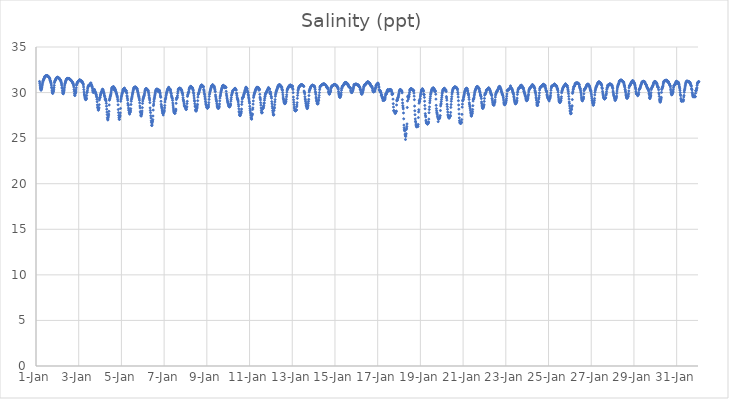
| Category | Salinity (ppt) |
|---|---|
| 44562.166666666664 | 31.22 |
| 44562.177083333336 | 31.03 |
| 44562.1875 | 30.82 |
| 44562.197916666664 | 30.61 |
| 44562.208333333336 | 30.48 |
| 44562.21875 | 30.39 |
| 44562.229166666664 | 30.3 |
| 44562.239583333336 | 30.26 |
| 44562.25 | 30.39 |
| 44562.260416666664 | 30.41 |
| 44562.270833333336 | 30.51 |
| 44562.28125 | 30.62 |
| 44562.291666666664 | 30.81 |
| 44562.302083333336 | 30.95 |
| 44562.3125 | 31.11 |
| 44562.322916666664 | 31.23 |
| 44562.333333333336 | 31.31 |
| 44562.34375 | 31.37 |
| 44562.354166666664 | 31.42 |
| 44562.364583333336 | 31.47 |
| 44562.375 | 31.52 |
| 44562.385416666664 | 31.57 |
| 44562.395833333336 | 31.65 |
| 44562.40625 | 31.72 |
| 44562.416666666664 | 31.78 |
| 44562.427083333336 | 31.79 |
| 44562.4375 | 31.8 |
| 44562.447916666664 | 31.82 |
| 44562.458333333336 | 31.82 |
| 44562.46875 | 31.83 |
| 44562.479166666664 | 31.84 |
| 44562.489583333336 | 31.85 |
| 44562.5 | 31.85 |
| 44562.510416666664 | 31.86 |
| 44562.520833333336 | 31.86 |
| 44562.53125 | 31.82 |
| 44562.541666666664 | 31.8 |
| 44562.552083333336 | 31.81 |
| 44562.5625 | 31.81 |
| 44562.572916666664 | 31.76 |
| 44562.583333333336 | 31.73 |
| 44562.59375 | 31.73 |
| 44562.604166666664 | 31.69 |
| 44562.614583333336 | 31.65 |
| 44562.625 | 31.6 |
| 44562.635416666664 | 31.55 |
| 44562.645833333336 | 31.51 |
| 44562.65625 | 31.38 |
| 44562.666666666664 | 31.33 |
| 44562.677083333336 | 31.25 |
| 44562.6875 | 31.17 |
| 44562.697916666664 | 31.08 |
| 44562.708333333336 | 30.97 |
| 44562.71875 | 30.82 |
| 44562.729166666664 | 30.59 |
| 44562.739583333336 | 30.5 |
| 44562.75 | 30.26 |
| 44562.760416666664 | 30.09 |
| 44562.770833333336 | 29.98 |
| 44562.78125 | 29.9 |
| 44562.791666666664 | 29.96 |
| 44562.802083333336 | 30.08 |
| 44562.8125 | 30.1 |
| 44562.822916666664 | 30.2 |
| 44562.833333333336 | 30.37 |
| 44562.84375 | 30.55 |
| 44562.854166666664 | 30.79 |
| 44562.864583333336 | 31.08 |
| 44562.875 | 31.19 |
| 44562.885416666664 | 31.27 |
| 44562.895833333336 | 31.32 |
| 44562.90625 | 31.37 |
| 44562.916666666664 | 31.42 |
| 44562.927083333336 | 31.46 |
| 44562.9375 | 31.53 |
| 44562.947916666664 | 31.58 |
| 44562.958333333336 | 31.61 |
| 44562.96875 | 31.63 |
| 44562.979166666664 | 31.66 |
| 44562.989583333336 | 31.66 |
| 44563.0 | 31.67 |
| 44563.010416666664 | 31.67 |
| 44563.020833333336 | 31.68 |
| 44563.03125 | 31.68 |
| 44563.041666666664 | 31.61 |
| 44563.052083333336 | 31.59 |
| 44563.0625 | 31.57 |
| 44563.072916666664 | 31.54 |
| 44563.083333333336 | 31.58 |
| 44563.09375 | 31.55 |
| 44563.104166666664 | 31.49 |
| 44563.114583333336 | 31.48 |
| 44563.125 | 31.39 |
| 44563.135416666664 | 31.4 |
| 44563.145833333336 | 31.34 |
| 44563.15625 | 31.32 |
| 44563.166666666664 | 31.24 |
| 44563.177083333336 | 31.15 |
| 44563.1875 | 31.06 |
| 44563.197916666664 | 30.93 |
| 44563.208333333336 | 30.78 |
| 44563.21875 | 30.55 |
| 44563.229166666664 | 30.45 |
| 44563.239583333336 | 30.21 |
| 44563.25 | 30.05 |
| 44563.260416666664 | 29.92 |
| 44563.270833333336 | 29.87 |
| 44563.28125 | 29.88 |
| 44563.291666666664 | 30.04 |
| 44563.302083333336 | 30.09 |
| 44563.3125 | 30.22 |
| 44563.322916666664 | 30.39 |
| 44563.333333333336 | 30.6 |
| 44563.34375 | 30.82 |
| 44563.354166666664 | 30.95 |
| 44563.364583333336 | 31.02 |
| 44563.375 | 31.12 |
| 44563.385416666664 | 31.21 |
| 44563.395833333336 | 31.28 |
| 44563.40625 | 31.35 |
| 44563.416666666664 | 31.4 |
| 44563.427083333336 | 31.45 |
| 44563.4375 | 31.5 |
| 44563.447916666664 | 31.53 |
| 44563.458333333336 | 31.53 |
| 44563.46875 | 31.55 |
| 44563.479166666664 | 31.55 |
| 44563.489583333336 | 31.55 |
| 44563.5 | 31.54 |
| 44563.510416666664 | 31.54 |
| 44563.520833333336 | 31.54 |
| 44563.53125 | 31.54 |
| 44563.541666666664 | 31.54 |
| 44563.552083333336 | 31.54 |
| 44563.5625 | 31.51 |
| 44563.572916666664 | 31.5 |
| 44563.583333333336 | 31.46 |
| 44563.59375 | 31.46 |
| 44563.604166666664 | 31.38 |
| 44563.614583333336 | 31.39 |
| 44563.625 | 31.37 |
| 44563.635416666664 | 31.35 |
| 44563.645833333336 | 31.35 |
| 44563.65625 | 31.3 |
| 44563.666666666664 | 31.27 |
| 44563.677083333336 | 31.22 |
| 44563.6875 | 31.19 |
| 44563.697916666664 | 31.18 |
| 44563.708333333336 | 31.08 |
| 44563.71875 | 31.07 |
| 44563.729166666664 | 31.05 |
| 44563.739583333336 | 30.97 |
| 44563.75 | 30.9 |
| 44563.760416666664 | 30.76 |
| 44563.770833333336 | 30.61 |
| 44563.78125 | 30.34 |
| 44563.791666666664 | 30.14 |
| 44563.802083333336 | 29.89 |
| 44563.8125 | 29.71 |
| 44563.822916666664 | 29.67 |
| 44563.833333333336 | 29.84 |
| 44563.84375 | 29.93 |
| 44563.854166666664 | 29.98 |
| 44563.864583333336 | 30.12 |
| 44563.875 | 30.29 |
| 44563.885416666664 | 30.52 |
| 44563.895833333336 | 30.8 |
| 44563.90625 | 30.9 |
| 44563.916666666664 | 30.99 |
| 44563.927083333336 | 31.05 |
| 44563.9375 | 31.1 |
| 44563.947916666664 | 31.13 |
| 44563.958333333336 | 31.15 |
| 44563.96875 | 31.18 |
| 44563.979166666664 | 31.22 |
| 44563.989583333336 | 31.26 |
| 44564.0 | 31.3 |
| 44564.010416666664 | 31.33 |
| 44564.020833333336 | 31.35 |
| 44564.03125 | 31.37 |
| 44564.041666666664 | 31.38 |
| 44564.052083333336 | 31.39 |
| 44564.0625 | 31.38 |
| 44564.072916666664 | 31.29 |
| 44564.083333333336 | 31.3 |
| 44564.09375 | 31.29 |
| 44564.104166666664 | 31.28 |
| 44564.114583333336 | 31.29 |
| 44564.125 | 31.28 |
| 44564.135416666664 | 31.24 |
| 44564.145833333336 | 31.21 |
| 44564.15625 | 31.24 |
| 44564.166666666664 | 31.14 |
| 44564.177083333336 | 31.1 |
| 44564.1875 | 31.06 |
| 44564.197916666664 | 31.01 |
| 44564.208333333336 | 30.95 |
| 44564.21875 | 30.84 |
| 44564.229166666664 | 30.61 |
| 44564.239583333336 | 30.33 |
| 44564.25 | 30.07 |
| 44564.260416666664 | 29.84 |
| 44564.270833333336 | 29.73 |
| 44564.28125 | 29.61 |
| 44564.291666666664 | 29.46 |
| 44564.302083333336 | 29.36 |
| 44564.3125 | 29.27 |
| 44564.322916666664 | 29.22 |
| 44564.333333333336 | 29.25 |
| 44564.34375 | 29.26 |
| 44564.354166666664 | 29.32 |
| 44564.364583333336 | 29.39 |
| 44564.375 | 29.68 |
| 44564.385416666664 | 29.99 |
| 44564.395833333336 | 30.05 |
| 44564.40625 | 30.2 |
| 44564.416666666664 | 30.41 |
| 44564.427083333336 | 30.55 |
| 44564.4375 | 30.67 |
| 44564.447916666664 | 30.72 |
| 44564.458333333336 | 30.76 |
| 44564.46875 | 30.8 |
| 44564.479166666664 | 30.8 |
| 44564.489583333336 | 30.81 |
| 44564.5 | 30.79 |
| 44564.510416666664 | 30.8 |
| 44564.520833333336 | 30.86 |
| 44564.53125 | 30.93 |
| 44564.541666666664 | 30.94 |
| 44564.552083333336 | 31 |
| 44564.5625 | 31.02 |
| 44564.572916666664 | 31.06 |
| 44564.583333333336 | 30.91 |
| 44564.59375 | 30.85 |
| 44564.604166666664 | 30.75 |
| 44564.614583333336 | 30.72 |
| 44564.625 | 30.68 |
| 44564.635416666664 | 30.58 |
| 44564.645833333336 | 30.41 |
| 44564.65625 | 30.23 |
| 44564.666666666664 | 30.13 |
| 44564.677083333336 | 30.02 |
| 44564.6875 | 30.03 |
| 44564.697916666664 | 30.09 |
| 44564.708333333336 | 30.09 |
| 44564.71875 | 30.34 |
| 44564.729166666664 | 30.22 |
| 44564.739583333336 | 30.34 |
| 44564.75 | 30.2 |
| 44564.760416666664 | 30.13 |
| 44564.770833333336 | 30.06 |
| 44564.78125 | 30.04 |
| 44564.791666666664 | 29.97 |
| 44564.802083333336 | 29.9 |
| 44564.8125 | 29.76 |
| 44564.822916666664 | 29.75 |
| 44564.833333333336 | 29.6 |
| 44564.84375 | 29.49 |
| 44564.854166666664 | 29.26 |
| 44564.864583333336 | 28.99 |
| 44564.875 | 28.65 |
| 44564.885416666664 | 28.41 |
| 44564.895833333336 | 28.33 |
| 44564.90625 | 28.21 |
| 44564.916666666664 | 28.07 |
| 44564.927083333336 | 28.11 |
| 44564.9375 | 28.25 |
| 44564.947916666664 | 28.35 |
| 44564.958333333336 | 28.67 |
| 44564.96875 | 29.19 |
| 44564.979166666664 | 29.37 |
| 44564.989583333336 | 29.47 |
| 44565.0 | 29.47 |
| 44565.010416666664 | 29.63 |
| 44565.020833333336 | 29.74 |
| 44565.03125 | 29.83 |
| 44565.041666666664 | 29.88 |
| 44565.052083333336 | 29.99 |
| 44565.0625 | 30.04 |
| 44565.072916666664 | 30.08 |
| 44565.083333333336 | 30.15 |
| 44565.09375 | 30.25 |
| 44565.104166666664 | 30.32 |
| 44565.114583333336 | 30.37 |
| 44565.125 | 30.34 |
| 44565.135416666664 | 30.3 |
| 44565.145833333336 | 30.22 |
| 44565.15625 | 30.04 |
| 44565.166666666664 | 30.08 |
| 44565.177083333336 | 29.96 |
| 44565.1875 | 29.89 |
| 44565.197916666664 | 29.73 |
| 44565.208333333336 | 29.64 |
| 44565.21875 | 29.56 |
| 44565.229166666664 | 29.41 |
| 44565.239583333336 | 29.22 |
| 44565.25 | 29.29 |
| 44565.260416666664 | 29.28 |
| 44565.270833333336 | 29.18 |
| 44565.28125 | 29.07 |
| 44565.291666666664 | 28.82 |
| 44565.302083333336 | 28.51 |
| 44565.3125 | 28.18 |
| 44565.322916666664 | 27.86 |
| 44565.333333333336 | 27.58 |
| 44565.34375 | 27.26 |
| 44565.354166666664 | 27.1 |
| 44565.364583333336 | 26.99 |
| 44565.375 | 27.1 |
| 44565.385416666664 | 27.3 |
| 44565.395833333336 | 27.45 |
| 44565.40625 | 27.64 |
| 44565.416666666664 | 27.94 |
| 44565.427083333336 | 28.64 |
| 44565.4375 | 29.16 |
| 44565.447916666664 | 29.27 |
| 44565.458333333336 | 29.34 |
| 44565.46875 | 29.49 |
| 44565.479166666664 | 29.59 |
| 44565.489583333336 | 29.67 |
| 44565.5 | 29.78 |
| 44565.510416666664 | 29.93 |
| 44565.520833333336 | 30.07 |
| 44565.53125 | 30.26 |
| 44565.541666666664 | 30.4 |
| 44565.552083333336 | 30.49 |
| 44565.5625 | 30.54 |
| 44565.572916666664 | 30.56 |
| 44565.583333333336 | 30.56 |
| 44565.59375 | 30.58 |
| 44565.604166666664 | 30.6 |
| 44565.614583333336 | 30.62 |
| 44565.625 | 30.63 |
| 44565.635416666664 | 30.65 |
| 44565.645833333336 | 30.57 |
| 44565.65625 | 30.36 |
| 44565.666666666664 | 30.27 |
| 44565.677083333336 | 30.5 |
| 44565.6875 | 30.45 |
| 44565.697916666664 | 30.39 |
| 44565.708333333336 | 30.31 |
| 44565.71875 | 30.29 |
| 44565.729166666664 | 30.14 |
| 44565.739583333336 | 30.14 |
| 44565.75 | 30.04 |
| 44565.760416666664 | 29.93 |
| 44565.770833333336 | 29.87 |
| 44565.78125 | 29.83 |
| 44565.791666666664 | 29.67 |
| 44565.802083333336 | 29.6 |
| 44565.8125 | 29.48 |
| 44565.822916666664 | 29.27 |
| 44565.833333333336 | 29.07 |
| 44565.84375 | 28.66 |
| 44565.854166666664 | 28.14 |
| 44565.864583333336 | 27.8 |
| 44565.875 | 27.49 |
| 44565.885416666664 | 27.24 |
| 44565.895833333336 | 27.08 |
| 44565.90625 | 27.05 |
| 44565.916666666664 | 27.31 |
| 44565.927083333336 | 27.37 |
| 44565.9375 | 27.5 |
| 44565.947916666664 | 27.77 |
| 44565.958333333336 | 28.26 |
| 44565.96875 | 29.05 |
| 44565.979166666664 | 29.27 |
| 44565.989583333336 | 29.4 |
| 44566.0 | 29.55 |
| 44566.010416666664 | 29.67 |
| 44566.020833333336 | 29.81 |
| 44566.03125 | 29.9 |
| 44566.041666666664 | 29.96 |
| 44566.052083333336 | 30.05 |
| 44566.0625 | 30.19 |
| 44566.072916666664 | 30.28 |
| 44566.083333333336 | 30.33 |
| 44566.09375 | 30.36 |
| 44566.104166666664 | 30.39 |
| 44566.114583333336 | 30.43 |
| 44566.125 | 30.44 |
| 44566.135416666664 | 30.48 |
| 44566.145833333336 | 30.48 |
| 44566.15625 | 30.33 |
| 44566.166666666664 | 30.26 |
| 44566.177083333336 | 30.17 |
| 44566.1875 | 30.32 |
| 44566.197916666664 | 30.26 |
| 44566.208333333336 | 30.17 |
| 44566.21875 | 30.19 |
| 44566.229166666664 | 30.2 |
| 44566.239583333336 | 30.02 |
| 44566.25 | 29.93 |
| 44566.260416666664 | 29.65 |
| 44566.270833333336 | 29.53 |
| 44566.28125 | 29.35 |
| 44566.291666666664 | 29.17 |
| 44566.302083333336 | 28.82 |
| 44566.3125 | 28.64 |
| 44566.322916666664 | 28.59 |
| 44566.333333333336 | 28.3 |
| 44566.34375 | 28.09 |
| 44566.354166666664 | 28.02 |
| 44566.364583333336 | 27.84 |
| 44566.375 | 27.73 |
| 44566.385416666664 | 27.63 |
| 44566.395833333336 | 27.8 |
| 44566.40625 | 27.86 |
| 44566.416666666664 | 27.88 |
| 44566.427083333336 | 28.01 |
| 44566.4375 | 28.23 |
| 44566.447916666664 | 28.69 |
| 44566.458333333336 | 29.04 |
| 44566.46875 | 29.23 |
| 44566.479166666664 | 29.35 |
| 44566.489583333336 | 29.48 |
| 44566.5 | 29.6 |
| 44566.510416666664 | 29.74 |
| 44566.520833333336 | 29.86 |
| 44566.53125 | 29.98 |
| 44566.541666666664 | 30.09 |
| 44566.552083333336 | 30.24 |
| 44566.5625 | 30.34 |
| 44566.572916666664 | 30.45 |
| 44566.583333333336 | 30.5 |
| 44566.59375 | 30.55 |
| 44566.604166666664 | 30.57 |
| 44566.614583333336 | 30.58 |
| 44566.625 | 30.58 |
| 44566.635416666664 | 30.59 |
| 44566.645833333336 | 30.6 |
| 44566.65625 | 30.6 |
| 44566.666666666664 | 30.6 |
| 44566.677083333336 | 30.54 |
| 44566.6875 | 30.57 |
| 44566.697916666664 | 30.53 |
| 44566.708333333336 | 30.43 |
| 44566.71875 | 30.44 |
| 44566.729166666664 | 30.43 |
| 44566.739583333336 | 30.37 |
| 44566.75 | 30.23 |
| 44566.760416666664 | 30.15 |
| 44566.770833333336 | 30.04 |
| 44566.78125 | 29.94 |
| 44566.791666666664 | 29.81 |
| 44566.802083333336 | 29.67 |
| 44566.8125 | 29.56 |
| 44566.822916666664 | 29.49 |
| 44566.833333333336 | 29.32 |
| 44566.84375 | 29.16 |
| 44566.854166666664 | 28.87 |
| 44566.864583333336 | 28.53 |
| 44566.875 | 28.31 |
| 44566.885416666664 | 27.92 |
| 44566.895833333336 | 27.79 |
| 44566.90625 | 27.53 |
| 44566.916666666664 | 27.44 |
| 44566.927083333336 | 27.43 |
| 44566.9375 | 27.62 |
| 44566.947916666664 | 27.64 |
| 44566.958333333336 | 27.77 |
| 44566.96875 | 27.98 |
| 44566.979166666664 | 28.35 |
| 44566.989583333336 | 28.81 |
| 44567.0 | 29.07 |
| 44567.010416666664 | 29.24 |
| 44567.020833333336 | 29.36 |
| 44567.03125 | 29.44 |
| 44567.041666666664 | 29.53 |
| 44567.052083333336 | 29.6 |
| 44567.0625 | 29.66 |
| 44567.072916666664 | 29.75 |
| 44567.083333333336 | 29.89 |
| 44567.09375 | 30.07 |
| 44567.104166666664 | 30.2 |
| 44567.114583333336 | 30.29 |
| 44567.125 | 30.34 |
| 44567.135416666664 | 30.38 |
| 44567.145833333336 | 30.41 |
| 44567.15625 | 30.42 |
| 44567.166666666664 | 30.44 |
| 44567.177083333336 | 30.43 |
| 44567.1875 | 30.34 |
| 44567.197916666664 | 30.36 |
| 44567.208333333336 | 30.29 |
| 44567.21875 | 30.29 |
| 44567.229166666664 | 30.24 |
| 44567.239583333336 | 30.28 |
| 44567.25 | 30.18 |
| 44567.260416666664 | 30.17 |
| 44567.270833333336 | 30.01 |
| 44567.28125 | 29.85 |
| 44567.291666666664 | 29.7 |
| 44567.302083333336 | 29.49 |
| 44567.3125 | 29.34 |
| 44567.322916666664 | 29.18 |
| 44567.333333333336 | 28.9 |
| 44567.34375 | 28.32 |
| 44567.354166666664 | 28.04 |
| 44567.364583333336 | 27.8 |
| 44567.375 | 27.46 |
| 44567.385416666664 | 27.21 |
| 44567.395833333336 | 26.9 |
| 44567.40625 | 26.72 |
| 44567.416666666664 | 26.4 |
| 44567.427083333336 | 26.38 |
| 44567.4375 | 26.55 |
| 44567.447916666664 | 26.75 |
| 44567.458333333336 | 26.87 |
| 44567.46875 | 27.03 |
| 44567.479166666664 | 27.43 |
| 44567.489583333336 | 28.08 |
| 44567.5 | 28.57 |
| 44567.510416666664 | 28.74 |
| 44567.520833333336 | 29.01 |
| 44567.53125 | 29.21 |
| 44567.541666666664 | 29.36 |
| 44567.552083333336 | 29.5 |
| 44567.5625 | 29.64 |
| 44567.572916666664 | 29.76 |
| 44567.583333333336 | 29.92 |
| 44567.59375 | 30.08 |
| 44567.604166666664 | 30.18 |
| 44567.614583333336 | 30.25 |
| 44567.625 | 30.3 |
| 44567.635416666664 | 30.35 |
| 44567.645833333336 | 30.36 |
| 44567.65625 | 30.37 |
| 44567.666666666664 | 30.36 |
| 44567.677083333336 | 30.35 |
| 44567.6875 | 30.36 |
| 44567.697916666664 | 30.35 |
| 44567.708333333336 | 30.28 |
| 44567.71875 | 30.11 |
| 44567.729166666664 | 30.2 |
| 44567.739583333336 | 30.23 |
| 44567.75 | 30.29 |
| 44567.760416666664 | 30.24 |
| 44567.770833333336 | 30.24 |
| 44567.78125 | 30.23 |
| 44567.791666666664 | 30.16 |
| 44567.802083333336 | 30 |
| 44567.8125 | 29.9 |
| 44567.822916666664 | 29.72 |
| 44567.833333333336 | 29.57 |
| 44567.84375 | 29.48 |
| 44567.854166666664 | 29.04 |
| 44567.864583333336 | 28.71 |
| 44567.875 | 28.52 |
| 44567.885416666664 | 28.4 |
| 44567.895833333336 | 28.26 |
| 44567.90625 | 28.08 |
| 44567.916666666664 | 27.97 |
| 44567.927083333336 | 27.85 |
| 44567.9375 | 27.72 |
| 44567.947916666664 | 27.69 |
| 44567.958333333336 | 27.54 |
| 44567.96875 | 27.83 |
| 44567.979166666664 | 27.79 |
| 44567.989583333336 | 27.87 |
| 44568.0 | 27.93 |
| 44568.010416666664 | 28.07 |
| 44568.020833333336 | 28.32 |
| 44568.03125 | 28.58 |
| 44568.041666666664 | 28.96 |
| 44568.052083333336 | 29.2 |
| 44568.0625 | 29.31 |
| 44568.072916666664 | 29.39 |
| 44568.083333333336 | 29.51 |
| 44568.09375 | 29.69 |
| 44568.104166666664 | 29.83 |
| 44568.114583333336 | 29.95 |
| 44568.125 | 30.04 |
| 44568.135416666664 | 30.12 |
| 44568.145833333336 | 30.22 |
| 44568.15625 | 30.3 |
| 44568.166666666664 | 30.36 |
| 44568.177083333336 | 30.43 |
| 44568.1875 | 30.45 |
| 44568.197916666664 | 30.51 |
| 44568.208333333336 | 30.56 |
| 44568.21875 | 30.58 |
| 44568.229166666664 | 30.42 |
| 44568.239583333336 | 30.3 |
| 44568.25 | 30.36 |
| 44568.260416666664 | 30.37 |
| 44568.270833333336 | 30.34 |
| 44568.28125 | 30.36 |
| 44568.291666666664 | 30.35 |
| 44568.302083333336 | 30.2 |
| 44568.3125 | 30.05 |
| 44568.322916666664 | 29.94 |
| 44568.333333333336 | 29.87 |
| 44568.34375 | 29.68 |
| 44568.354166666664 | 29.54 |
| 44568.364583333336 | 29.5 |
| 44568.375 | 29.41 |
| 44568.385416666664 | 29.34 |
| 44568.395833333336 | 29.14 |
| 44568.40625 | 28.86 |
| 44568.416666666664 | 28.63 |
| 44568.427083333336 | 28.41 |
| 44568.4375 | 28.2 |
| 44568.447916666664 | 28.01 |
| 44568.458333333336 | 27.91 |
| 44568.46875 | 27.83 |
| 44568.479166666664 | 27.78 |
| 44568.489583333336 | 27.73 |
| 44568.5 | 27.73 |
| 44568.510416666664 | 27.73 |
| 44568.520833333336 | 27.88 |
| 44568.53125 | 27.96 |
| 44568.541666666664 | 28.04 |
| 44568.552083333336 | 28.18 |
| 44568.5625 | 28.82 |
| 44568.572916666664 | 29.23 |
| 44568.583333333336 | 29.39 |
| 44568.59375 | 29.42 |
| 44568.604166666664 | 29.39 |
| 44568.614583333336 | 29.47 |
| 44568.625 | 29.65 |
| 44568.635416666664 | 29.9 |
| 44568.645833333336 | 30.11 |
| 44568.65625 | 30.28 |
| 44568.666666666664 | 30.35 |
| 44568.677083333336 | 30.42 |
| 44568.6875 | 30.38 |
| 44568.697916666664 | 30.47 |
| 44568.708333333336 | 30.48 |
| 44568.71875 | 30.49 |
| 44568.729166666664 | 30.42 |
| 44568.739583333336 | 30.42 |
| 44568.75 | 30.47 |
| 44568.760416666664 | 30.45 |
| 44568.770833333336 | 30.44 |
| 44568.78125 | 30.35 |
| 44568.791666666664 | 30.38 |
| 44568.802083333336 | 30.32 |
| 44568.8125 | 30.27 |
| 44568.822916666664 | 30.23 |
| 44568.833333333336 | 30.13 |
| 44568.84375 | 29.99 |
| 44568.854166666664 | 29.93 |
| 44568.864583333336 | 29.86 |
| 44568.875 | 29.71 |
| 44568.885416666664 | 29.44 |
| 44568.895833333336 | 29.25 |
| 44568.90625 | 29.14 |
| 44568.916666666664 | 29.03 |
| 44568.927083333336 | 28.86 |
| 44568.9375 | 28.74 |
| 44568.947916666664 | 28.58 |
| 44568.958333333336 | 28.51 |
| 44568.96875 | 28.44 |
| 44568.979166666664 | 28.45 |
| 44568.989583333336 | 28.44 |
| 44569.0 | 28.35 |
| 44569.010416666664 | 28.26 |
| 44569.020833333336 | 28.2 |
| 44569.03125 | 28.14 |
| 44569.041666666664 | 28.16 |
| 44569.052083333336 | 28.37 |
| 44569.0625 | 28.46 |
| 44569.072916666664 | 28.79 |
| 44569.083333333336 | 29.04 |
| 44569.09375 | 29.58 |
| 44569.104166666664 | 29.73 |
| 44569.114583333336 | 29.81 |
| 44569.125 | 29.95 |
| 44569.135416666664 | 29.99 |
| 44569.145833333336 | 30.02 |
| 44569.15625 | 30.14 |
| 44569.166666666664 | 30.31 |
| 44569.177083333336 | 30.41 |
| 44569.1875 | 30.5 |
| 44569.197916666664 | 30.54 |
| 44569.208333333336 | 30.59 |
| 44569.21875 | 30.62 |
| 44569.229166666664 | 30.62 |
| 44569.239583333336 | 30.68 |
| 44569.25 | 30.68 |
| 44569.260416666664 | 30.65 |
| 44569.270833333336 | 30.62 |
| 44569.28125 | 30.6 |
| 44569.291666666664 | 30.59 |
| 44569.302083333336 | 30.58 |
| 44569.3125 | 30.55 |
| 44569.322916666664 | 30.5 |
| 44569.333333333336 | 30.46 |
| 44569.34375 | 30.37 |
| 44569.354166666664 | 30.3 |
| 44569.364583333336 | 30.21 |
| 44569.375 | 30 |
| 44569.385416666664 | 29.87 |
| 44569.395833333336 | 29.64 |
| 44569.40625 | 29.4 |
| 44569.416666666664 | 29.16 |
| 44569.427083333336 | 29.03 |
| 44569.4375 | 28.77 |
| 44569.447916666664 | 28.52 |
| 44569.458333333336 | 28.44 |
| 44569.46875 | 28.13 |
| 44569.479166666664 | 28.01 |
| 44569.489583333336 | 28 |
| 44569.5 | 27.96 |
| 44569.510416666664 | 28.05 |
| 44569.520833333336 | 28.21 |
| 44569.53125 | 28.26 |
| 44569.541666666664 | 28.36 |
| 44569.552083333336 | 28.53 |
| 44569.5625 | 28.71 |
| 44569.572916666664 | 29.11 |
| 44569.583333333336 | 29.5 |
| 44569.59375 | 29.78 |
| 44569.604166666664 | 29.82 |
| 44569.614583333336 | 29.9 |
| 44569.625 | 29.99 |
| 44569.635416666664 | 30.07 |
| 44569.645833333336 | 30.18 |
| 44569.65625 | 30.26 |
| 44569.666666666664 | 30.35 |
| 44569.677083333336 | 30.42 |
| 44569.6875 | 30.5 |
| 44569.697916666664 | 30.57 |
| 44569.708333333336 | 30.64 |
| 44569.71875 | 30.69 |
| 44569.729166666664 | 30.76 |
| 44569.739583333336 | 30.79 |
| 44569.75 | 30.81 |
| 44569.760416666664 | 30.82 |
| 44569.770833333336 | 30.82 |
| 44569.78125 | 30.75 |
| 44569.791666666664 | 30.68 |
| 44569.802083333336 | 30.71 |
| 44569.8125 | 30.73 |
| 44569.822916666664 | 30.68 |
| 44569.833333333336 | 30.66 |
| 44569.84375 | 30.62 |
| 44569.854166666664 | 30.35 |
| 44569.864583333336 | 30.24 |
| 44569.875 | 30.08 |
| 44569.885416666664 | 29.89 |
| 44569.895833333336 | 29.77 |
| 44569.90625 | 29.58 |
| 44569.916666666664 | 29.4 |
| 44569.927083333336 | 29.27 |
| 44569.9375 | 29.04 |
| 44569.947916666664 | 28.86 |
| 44569.958333333336 | 28.72 |
| 44569.96875 | 28.64 |
| 44569.979166666664 | 28.61 |
| 44569.989583333336 | 28.43 |
| 44570.0 | 28.39 |
| 44570.010416666664 | 28.33 |
| 44570.020833333336 | 28.3 |
| 44570.03125 | 28.27 |
| 44570.041666666664 | 28.34 |
| 44570.052083333336 | 28.39 |
| 44570.0625 | 28.38 |
| 44570.072916666664 | 28.46 |
| 44570.083333333336 | 28.64 |
| 44570.09375 | 28.9 |
| 44570.104166666664 | 29.25 |
| 44570.114583333336 | 29.57 |
| 44570.125 | 29.8 |
| 44570.135416666664 | 29.94 |
| 44570.145833333336 | 30.07 |
| 44570.15625 | 30.16 |
| 44570.166666666664 | 30.26 |
| 44570.177083333336 | 30.35 |
| 44570.1875 | 30.45 |
| 44570.197916666664 | 30.53 |
| 44570.208333333336 | 30.62 |
| 44570.21875 | 30.69 |
| 44570.229166666664 | 30.74 |
| 44570.239583333336 | 30.77 |
| 44570.25 | 30.8 |
| 44570.260416666664 | 30.81 |
| 44570.270833333336 | 30.88 |
| 44570.28125 | 30.71 |
| 44570.291666666664 | 30.75 |
| 44570.302083333336 | 30.75 |
| 44570.3125 | 30.67 |
| 44570.322916666664 | 30.74 |
| 44570.333333333336 | 30.62 |
| 44570.34375 | 30.69 |
| 44570.354166666664 | 30.57 |
| 44570.364583333336 | 30.45 |
| 44570.375 | 30.32 |
| 44570.385416666664 | 30.17 |
| 44570.395833333336 | 30.1 |
| 44570.40625 | 29.74 |
| 44570.416666666664 | 29.55 |
| 44570.427083333336 | 29.4 |
| 44570.4375 | 29.26 |
| 44570.447916666664 | 29.1 |
| 44570.458333333336 | 29 |
| 44570.46875 | 28.78 |
| 44570.479166666664 | 28.63 |
| 44570.489583333336 | 28.49 |
| 44570.5 | 28.4 |
| 44570.510416666664 | 28.37 |
| 44570.520833333336 | 28.31 |
| 44570.53125 | 28.27 |
| 44570.541666666664 | 28.26 |
| 44570.552083333336 | 28.38 |
| 44570.5625 | 28.31 |
| 44570.572916666664 | 28.4 |
| 44570.583333333336 | 28.51 |
| 44570.59375 | 28.75 |
| 44570.604166666664 | 29.09 |
| 44570.614583333336 | 29.39 |
| 44570.625 | 29.59 |
| 44570.635416666664 | 29.69 |
| 44570.645833333336 | 29.84 |
| 44570.65625 | 29.98 |
| 44570.666666666664 | 30.12 |
| 44570.677083333336 | 30.23 |
| 44570.6875 | 30.34 |
| 44570.697916666664 | 30.43 |
| 44570.708333333336 | 30.51 |
| 44570.71875 | 30.57 |
| 44570.729166666664 | 30.67 |
| 44570.739583333336 | 30.75 |
| 44570.75 | 30.76 |
| 44570.760416666664 | 30.78 |
| 44570.770833333336 | 30.79 |
| 44570.78125 | 30.79 |
| 44570.791666666664 | 30.62 |
| 44570.802083333336 | 30.62 |
| 44570.8125 | 30.66 |
| 44570.822916666664 | 30.55 |
| 44570.833333333336 | 30.61 |
| 44570.84375 | 30.52 |
| 44570.854166666664 | 30.67 |
| 44570.864583333336 | 30.66 |
| 44570.875 | 30.64 |
| 44570.885416666664 | 30.56 |
| 44570.895833333336 | 30.56 |
| 44570.90625 | 30.14 |
| 44570.916666666664 | 29.86 |
| 44570.927083333336 | 29.69 |
| 44570.9375 | 29.52 |
| 44570.947916666664 | 29.36 |
| 44570.958333333336 | 29.19 |
| 44570.96875 | 29.07 |
| 44570.979166666664 | 28.95 |
| 44570.989583333336 | 28.88 |
| 44571.0 | 28.78 |
| 44571.010416666664 | 28.68 |
| 44571.020833333336 | 28.58 |
| 44571.03125 | 28.51 |
| 44571.041666666664 | 28.46 |
| 44571.052083333336 | 28.43 |
| 44571.0625 | 28.44 |
| 44571.072916666664 | 28.48 |
| 44571.083333333336 | 28.53 |
| 44571.09375 | 28.56 |
| 44571.104166666664 | 28.64 |
| 44571.114583333336 | 28.75 |
| 44571.125 | 29.05 |
| 44571.135416666664 | 29.25 |
| 44571.145833333336 | 29.45 |
| 44571.15625 | 29.69 |
| 44571.166666666664 | 29.75 |
| 44571.177083333336 | 29.86 |
| 44571.1875 | 29.96 |
| 44571.197916666664 | 30.05 |
| 44571.208333333336 | 30.15 |
| 44571.21875 | 30.22 |
| 44571.229166666664 | 30.25 |
| 44571.239583333336 | 30.26 |
| 44571.25 | 30.29 |
| 44571.260416666664 | 30.31 |
| 44571.270833333336 | 30.33 |
| 44571.28125 | 30.37 |
| 44571.291666666664 | 30.41 |
| 44571.302083333336 | 30.41 |
| 44571.3125 | 30.42 |
| 44571.322916666664 | 30.48 |
| 44571.333333333336 | 30.42 |
| 44571.34375 | 30.39 |
| 44571.354166666664 | 30.34 |
| 44571.364583333336 | 30.28 |
| 44571.375 | 30.27 |
| 44571.385416666664 | 29.9 |
| 44571.395833333336 | 29.91 |
| 44571.40625 | 29.7 |
| 44571.416666666664 | 29.5 |
| 44571.427083333336 | 29.39 |
| 44571.4375 | 29.28 |
| 44571.447916666664 | 29.26 |
| 44571.458333333336 | 29.13 |
| 44571.46875 | 28.97 |
| 44571.479166666664 | 28.72 |
| 44571.489583333336 | 28.51 |
| 44571.5 | 28.22 |
| 44571.510416666664 | 27.92 |
| 44571.520833333336 | 27.8 |
| 44571.53125 | 27.59 |
| 44571.541666666664 | 27.5 |
| 44571.552083333336 | 27.47 |
| 44571.5625 | 27.47 |
| 44571.572916666664 | 27.64 |
| 44571.583333333336 | 27.69 |
| 44571.59375 | 27.71 |
| 44571.604166666664 | 27.8 |
| 44571.614583333336 | 27.94 |
| 44571.625 | 28.19 |
| 44571.635416666664 | 28.7 |
| 44571.645833333336 | 28.99 |
| 44571.65625 | 29.29 |
| 44571.666666666664 | 29.43 |
| 44571.677083333336 | 29.46 |
| 44571.6875 | 29.47 |
| 44571.697916666664 | 29.48 |
| 44571.708333333336 | 29.53 |
| 44571.71875 | 29.64 |
| 44571.729166666664 | 29.76 |
| 44571.739583333336 | 29.84 |
| 44571.75 | 29.88 |
| 44571.760416666664 | 29.97 |
| 44571.770833333336 | 30.08 |
| 44571.78125 | 30.19 |
| 44571.791666666664 | 30.26 |
| 44571.802083333336 | 30.33 |
| 44571.8125 | 30.39 |
| 44571.822916666664 | 30.51 |
| 44571.833333333336 | 30.6 |
| 44571.84375 | 30.55 |
| 44571.854166666664 | 30.51 |
| 44571.864583333336 | 30.45 |
| 44571.875 | 30.45 |
| 44571.885416666664 | 30.41 |
| 44571.895833333336 | 30.24 |
| 44571.90625 | 30.07 |
| 44571.916666666664 | 30.03 |
| 44571.927083333336 | 30 |
| 44571.9375 | 29.78 |
| 44571.947916666664 | 29.67 |
| 44571.958333333336 | 29.48 |
| 44571.96875 | 29.35 |
| 44571.979166666664 | 29.19 |
| 44571.989583333336 | 29 |
| 44572.0 | 28.83 |
| 44572.010416666664 | 28.5 |
| 44572.020833333336 | 28.24 |
| 44572.03125 | 28.03 |
| 44572.041666666664 | 27.84 |
| 44572.052083333336 | 27.67 |
| 44572.0625 | 27.49 |
| 44572.072916666664 | 27.23 |
| 44572.083333333336 | 27.22 |
| 44572.09375 | 27.09 |
| 44572.104166666664 | 27.1 |
| 44572.114583333336 | 27.46 |
| 44572.125 | 27.57 |
| 44572.135416666664 | 27.66 |
| 44572.145833333336 | 28.15 |
| 44572.15625 | 28.32 |
| 44572.166666666664 | 28.73 |
| 44572.177083333336 | 29.08 |
| 44572.1875 | 29.45 |
| 44572.197916666664 | 29.62 |
| 44572.208333333336 | 29.72 |
| 44572.21875 | 29.82 |
| 44572.229166666664 | 29.91 |
| 44572.239583333336 | 29.97 |
| 44572.25 | 30.05 |
| 44572.260416666664 | 30.14 |
| 44572.270833333336 | 30.2 |
| 44572.28125 | 30.28 |
| 44572.291666666664 | 30.34 |
| 44572.302083333336 | 30.4 |
| 44572.3125 | 30.42 |
| 44572.322916666664 | 30.48 |
| 44572.333333333336 | 30.55 |
| 44572.34375 | 30.58 |
| 44572.354166666664 | 30.59 |
| 44572.364583333336 | 30.56 |
| 44572.375 | 30.51 |
| 44572.385416666664 | 30.51 |
| 44572.395833333336 | 30.56 |
| 44572.40625 | 30.54 |
| 44572.416666666664 | 30.54 |
| 44572.427083333336 | 30.49 |
| 44572.4375 | 30.26 |
| 44572.447916666664 | 30.37 |
| 44572.458333333336 | 30.4 |
| 44572.46875 | 30.31 |
| 44572.479166666664 | 29.81 |
| 44572.489583333336 | 29.49 |
| 44572.5 | 29.38 |
| 44572.510416666664 | 29.2 |
| 44572.520833333336 | 28.89 |
| 44572.53125 | 28.62 |
| 44572.541666666664 | 28.31 |
| 44572.552083333336 | 28.05 |
| 44572.5625 | 27.86 |
| 44572.572916666664 | 27.77 |
| 44572.583333333336 | 27.77 |
| 44572.59375 | 27.82 |
| 44572.604166666664 | 28.16 |
| 44572.614583333336 | 28.34 |
| 44572.625 | 28.3 |
| 44572.635416666664 | 28.28 |
| 44572.645833333336 | 28.32 |
| 44572.65625 | 28.44 |
| 44572.666666666664 | 28.58 |
| 44572.677083333336 | 28.81 |
| 44572.6875 | 28.87 |
| 44572.697916666664 | 29.16 |
| 44572.708333333336 | 29.36 |
| 44572.71875 | 29.54 |
| 44572.729166666664 | 29.62 |
| 44572.739583333336 | 29.77 |
| 44572.75 | 29.88 |
| 44572.760416666664 | 29.92 |
| 44572.770833333336 | 29.96 |
| 44572.78125 | 29.99 |
| 44572.791666666664 | 30.06 |
| 44572.802083333336 | 30.11 |
| 44572.8125 | 30.14 |
| 44572.822916666664 | 30.21 |
| 44572.833333333336 | 30.26 |
| 44572.84375 | 30.32 |
| 44572.854166666664 | 30.35 |
| 44572.864583333336 | 30.39 |
| 44572.875 | 30.46 |
| 44572.885416666664 | 30.56 |
| 44572.895833333336 | 30.44 |
| 44572.90625 | 30.45 |
| 44572.916666666664 | 30.39 |
| 44572.927083333336 | 30.41 |
| 44572.9375 | 30.41 |
| 44572.947916666664 | 30.03 |
| 44572.958333333336 | 29.88 |
| 44572.96875 | 30.08 |
| 44572.979166666664 | 30.07 |
| 44572.989583333336 | 29.83 |
| 44573.0 | 29.85 |
| 44573.010416666664 | 29.61 |
| 44573.020833333336 | 29.54 |
| 44573.03125 | 29.38 |
| 44573.041666666664 | 29.01 |
| 44573.052083333336 | 28.77 |
| 44573.0625 | 28.5 |
| 44573.072916666664 | 28.29 |
| 44573.083333333336 | 28.03 |
| 44573.09375 | 27.87 |
| 44573.104166666664 | 27.76 |
| 44573.114583333336 | 27.57 |
| 44573.125 | 27.53 |
| 44573.135416666664 | 27.59 |
| 44573.145833333336 | 28.03 |
| 44573.15625 | 28.25 |
| 44573.166666666664 | 28.38 |
| 44573.177083333336 | 28.67 |
| 44573.1875 | 28.97 |
| 44573.197916666664 | 29.23 |
| 44573.208333333336 | 29.59 |
| 44573.21875 | 29.77 |
| 44573.229166666664 | 29.92 |
| 44573.239583333336 | 30.04 |
| 44573.25 | 30.14 |
| 44573.260416666664 | 30.21 |
| 44573.270833333336 | 30.25 |
| 44573.28125 | 30.32 |
| 44573.291666666664 | 30.4 |
| 44573.302083333336 | 30.47 |
| 44573.3125 | 30.54 |
| 44573.322916666664 | 30.64 |
| 44573.333333333336 | 30.7 |
| 44573.34375 | 30.74 |
| 44573.354166666664 | 30.78 |
| 44573.364583333336 | 30.8 |
| 44573.375 | 30.82 |
| 44573.385416666664 | 30.85 |
| 44573.395833333336 | 30.85 |
| 44573.40625 | 30.86 |
| 44573.416666666664 | 30.85 |
| 44573.427083333336 | 30.8 |
| 44573.4375 | 30.81 |
| 44573.447916666664 | 30.75 |
| 44573.458333333336 | 30.64 |
| 44573.46875 | 30.6 |
| 44573.479166666664 | 30.62 |
| 44573.489583333336 | 30.65 |
| 44573.5 | 30.65 |
| 44573.510416666664 | 30.55 |
| 44573.520833333336 | 30.31 |
| 44573.53125 | 30.36 |
| 44573.541666666664 | 30.22 |
| 44573.552083333336 | 29.99 |
| 44573.5625 | 29.75 |
| 44573.572916666664 | 29.51 |
| 44573.583333333336 | 29.34 |
| 44573.59375 | 29.23 |
| 44573.604166666664 | 29.08 |
| 44573.614583333336 | 28.97 |
| 44573.625 | 28.89 |
| 44573.635416666664 | 28.84 |
| 44573.645833333336 | 28.79 |
| 44573.65625 | 28.78 |
| 44573.666666666664 | 28.8 |
| 44573.677083333336 | 28.9 |
| 44573.6875 | 28.99 |
| 44573.697916666664 | 28.96 |
| 44573.708333333336 | 29.06 |
| 44573.71875 | 29.26 |
| 44573.729166666664 | 29.53 |
| 44573.739583333336 | 29.76 |
| 44573.75 | 30.05 |
| 44573.760416666664 | 30.25 |
| 44573.770833333336 | 30.35 |
| 44573.78125 | 30.39 |
| 44573.791666666664 | 30.47 |
| 44573.802083333336 | 30.49 |
| 44573.8125 | 30.55 |
| 44573.822916666664 | 30.6 |
| 44573.833333333336 | 30.63 |
| 44573.84375 | 30.68 |
| 44573.854166666664 | 30.73 |
| 44573.864583333336 | 30.74 |
| 44573.875 | 30.77 |
| 44573.885416666664 | 30.8 |
| 44573.895833333336 | 30.81 |
| 44573.90625 | 30.81 |
| 44573.916666666664 | 30.81 |
| 44573.927083333336 | 30.81 |
| 44573.9375 | 30.71 |
| 44573.947916666664 | 30.64 |
| 44573.958333333336 | 30.62 |
| 44573.96875 | 30.7 |
| 44573.979166666664 | 30.69 |
| 44573.989583333336 | 30.72 |
| 44574.0 | 30.73 |
| 44574.010416666664 | 30.69 |
| 44574.020833333336 | 30.47 |
| 44574.03125 | 30.34 |
| 44574.041666666664 | 29.99 |
| 44574.052083333336 | 29.51 |
| 44574.0625 | 29.21 |
| 44574.072916666664 | 28.93 |
| 44574.083333333336 | 28.68 |
| 44574.09375 | 28.41 |
| 44574.104166666664 | 28.25 |
| 44574.114583333336 | 28.09 |
| 44574.125 | 28.02 |
| 44574.135416666664 | 28.01 |
| 44574.145833333336 | 28 |
| 44574.15625 | 27.99 |
| 44574.166666666664 | 28.02 |
| 44574.177083333336 | 28.07 |
| 44574.1875 | 28.09 |
| 44574.197916666664 | 28.1 |
| 44574.208333333336 | 28.45 |
| 44574.21875 | 28.64 |
| 44574.229166666664 | 28.89 |
| 44574.239583333336 | 29.36 |
| 44574.25 | 29.69 |
| 44574.260416666664 | 29.96 |
| 44574.270833333336 | 30.2 |
| 44574.28125 | 30.33 |
| 44574.291666666664 | 30.45 |
| 44574.302083333336 | 30.53 |
| 44574.3125 | 30.59 |
| 44574.322916666664 | 30.63 |
| 44574.333333333336 | 30.67 |
| 44574.34375 | 30.68 |
| 44574.354166666664 | 30.7 |
| 44574.364583333336 | 30.73 |
| 44574.375 | 30.77 |
| 44574.385416666664 | 30.79 |
| 44574.395833333336 | 30.82 |
| 44574.40625 | 30.84 |
| 44574.416666666664 | 30.86 |
| 44574.427083333336 | 30.87 |
| 44574.4375 | 30.86 |
| 44574.447916666664 | 30.87 |
| 44574.458333333336 | 30.83 |
| 44574.46875 | 30.83 |
| 44574.479166666664 | 30.81 |
| 44574.489583333336 | 30.78 |
| 44574.5 | 30.79 |
| 44574.510416666664 | 30.77 |
| 44574.520833333336 | 30.74 |
| 44574.53125 | 30.71 |
| 44574.541666666664 | 30.66 |
| 44574.552083333336 | 30.17 |
| 44574.5625 | 30.07 |
| 44574.572916666664 | 30.01 |
| 44574.583333333336 | 29.85 |
| 44574.59375 | 29.54 |
| 44574.604166666664 | 29.3 |
| 44574.614583333336 | 29.21 |
| 44574.625 | 29.03 |
| 44574.635416666664 | 28.85 |
| 44574.645833333336 | 28.75 |
| 44574.65625 | 28.59 |
| 44574.666666666664 | 28.5 |
| 44574.677083333336 | 28.43 |
| 44574.6875 | 28.34 |
| 44574.697916666664 | 28.24 |
| 44574.708333333336 | 28.26 |
| 44574.71875 | 28.36 |
| 44574.729166666664 | 28.51 |
| 44574.739583333336 | 28.61 |
| 44574.75 | 28.83 |
| 44574.760416666664 | 29.04 |
| 44574.770833333336 | 29.26 |
| 44574.78125 | 29.67 |
| 44574.791666666664 | 30.05 |
| 44574.802083333336 | 30.2 |
| 44574.8125 | 30.25 |
| 44574.822916666664 | 30.35 |
| 44574.833333333336 | 30.42 |
| 44574.84375 | 30.48 |
| 44574.854166666664 | 30.55 |
| 44574.864583333336 | 30.6 |
| 44574.875 | 30.65 |
| 44574.885416666664 | 30.7 |
| 44574.895833333336 | 30.72 |
| 44574.90625 | 30.76 |
| 44574.916666666664 | 30.78 |
| 44574.927083333336 | 30.79 |
| 44574.9375 | 30.8 |
| 44574.947916666664 | 30.81 |
| 44574.958333333336 | 30.81 |
| 44574.96875 | 30.77 |
| 44574.979166666664 | 30.77 |
| 44574.989583333336 | 30.76 |
| 44575.0 | 30.73 |
| 44575.010416666664 | 30.74 |
| 44575.020833333336 | 30.72 |
| 44575.03125 | 30.69 |
| 44575.041666666664 | 30.68 |
| 44575.052083333336 | 30.59 |
| 44575.0625 | 30.5 |
| 44575.072916666664 | 30.33 |
| 44575.083333333336 | 30.1 |
| 44575.09375 | 29.96 |
| 44575.104166666664 | 29.79 |
| 44575.114583333336 | 29.5 |
| 44575.125 | 29.35 |
| 44575.135416666664 | 29.17 |
| 44575.145833333336 | 29.05 |
| 44575.15625 | 28.98 |
| 44575.166666666664 | 28.83 |
| 44575.177083333336 | 28.79 |
| 44575.1875 | 28.75 |
| 44575.197916666664 | 28.77 |
| 44575.208333333336 | 28.77 |
| 44575.21875 | 28.97 |
| 44575.229166666664 | 29.15 |
| 44575.239583333336 | 29.17 |
| 44575.25 | 29.45 |
| 44575.260416666664 | 29.69 |
| 44575.270833333336 | 30 |
| 44575.28125 | 30.32 |
| 44575.291666666664 | 30.51 |
| 44575.302083333336 | 30.62 |
| 44575.3125 | 30.68 |
| 44575.322916666664 | 30.71 |
| 44575.333333333336 | 30.74 |
| 44575.34375 | 30.76 |
| 44575.354166666664 | 30.78 |
| 44575.364583333336 | 30.79 |
| 44575.375 | 30.81 |
| 44575.385416666664 | 30.84 |
| 44575.395833333336 | 30.86 |
| 44575.40625 | 30.88 |
| 44575.416666666664 | 30.89 |
| 44575.427083333336 | 30.91 |
| 44575.4375 | 30.92 |
| 44575.447916666664 | 30.93 |
| 44575.458333333336 | 30.94 |
| 44575.46875 | 30.94 |
| 44575.479166666664 | 30.95 |
| 44575.489583333336 | 30.95 |
| 44575.5 | 30.89 |
| 44575.510416666664 | 30.93 |
| 44575.520833333336 | 30.91 |
| 44575.53125 | 30.88 |
| 44575.541666666664 | 30.85 |
| 44575.552083333336 | 30.86 |
| 44575.5625 | 30.84 |
| 44575.572916666664 | 30.81 |
| 44575.583333333336 | 30.76 |
| 44575.59375 | 30.72 |
| 44575.604166666664 | 30.67 |
| 44575.614583333336 | 30.59 |
| 44575.625 | 30.54 |
| 44575.635416666664 | 30.51 |
| 44575.645833333336 | 30.55 |
| 44575.65625 | 30.54 |
| 44575.666666666664 | 30.52 |
| 44575.677083333336 | 30.41 |
| 44575.6875 | 30.33 |
| 44575.697916666664 | 30.09 |
| 44575.708333333336 | 30.04 |
| 44575.71875 | 29.92 |
| 44575.729166666664 | 29.84 |
| 44575.739583333336 | 29.83 |
| 44575.75 | 29.87 |
| 44575.760416666664 | 29.99 |
| 44575.770833333336 | 30.03 |
| 44575.78125 | 30.09 |
| 44575.791666666664 | 30.16 |
| 44575.802083333336 | 30.27 |
| 44575.8125 | 30.47 |
| 44575.822916666664 | 30.56 |
| 44575.833333333336 | 30.63 |
| 44575.84375 | 30.68 |
| 44575.854166666664 | 30.71 |
| 44575.864583333336 | 30.72 |
| 44575.875 | 30.73 |
| 44575.885416666664 | 30.76 |
| 44575.895833333336 | 30.78 |
| 44575.90625 | 30.79 |
| 44575.916666666664 | 30.81 |
| 44575.927083333336 | 30.82 |
| 44575.9375 | 30.85 |
| 44575.947916666664 | 30.87 |
| 44575.958333333336 | 30.88 |
| 44575.96875 | 30.88 |
| 44575.979166666664 | 30.89 |
| 44575.989583333336 | 30.88 |
| 44576.0 | 30.83 |
| 44576.010416666664 | 30.86 |
| 44576.020833333336 | 30.86 |
| 44576.03125 | 30.85 |
| 44576.041666666664 | 30.82 |
| 44576.052083333336 | 30.81 |
| 44576.0625 | 30.78 |
| 44576.072916666664 | 30.75 |
| 44576.083333333336 | 30.74 |
| 44576.09375 | 30.73 |
| 44576.104166666664 | 30.66 |
| 44576.114583333336 | 30.6 |
| 44576.125 | 30.55 |
| 44576.135416666664 | 30.55 |
| 44576.145833333336 | 30.47 |
| 44576.15625 | 30.36 |
| 44576.166666666664 | 30.12 |
| 44576.177083333336 | 29.93 |
| 44576.1875 | 29.79 |
| 44576.197916666664 | 29.7 |
| 44576.208333333336 | 29.57 |
| 44576.21875 | 29.52 |
| 44576.229166666664 | 29.49 |
| 44576.239583333336 | 29.47 |
| 44576.25 | 29.54 |
| 44576.260416666664 | 29.64 |
| 44576.270833333336 | 29.68 |
| 44576.28125 | 29.81 |
| 44576.291666666664 | 29.99 |
| 44576.302083333336 | 30.25 |
| 44576.3125 | 30.44 |
| 44576.322916666664 | 30.48 |
| 44576.333333333336 | 30.58 |
| 44576.34375 | 30.66 |
| 44576.354166666664 | 30.7 |
| 44576.364583333336 | 30.72 |
| 44576.375 | 30.74 |
| 44576.385416666664 | 30.77 |
| 44576.395833333336 | 30.81 |
| 44576.40625 | 30.86 |
| 44576.416666666664 | 30.91 |
| 44576.427083333336 | 30.94 |
| 44576.4375 | 30.96 |
| 44576.447916666664 | 31.01 |
| 44576.458333333336 | 31.05 |
| 44576.46875 | 31.07 |
| 44576.479166666664 | 31.09 |
| 44576.489583333336 | 31.1 |
| 44576.5 | 31.11 |
| 44576.510416666664 | 31.12 |
| 44576.520833333336 | 30.96 |
| 44576.53125 | 30.94 |
| 44576.541666666664 | 31.08 |
| 44576.552083333336 | 31.04 |
| 44576.5625 | 31 |
| 44576.572916666664 | 30.97 |
| 44576.583333333336 | 30.95 |
| 44576.59375 | 30.94 |
| 44576.604166666664 | 30.93 |
| 44576.614583333336 | 30.89 |
| 44576.625 | 30.82 |
| 44576.635416666664 | 30.73 |
| 44576.645833333336 | 30.65 |
| 44576.65625 | 30.65 |
| 44576.666666666664 | 30.59 |
| 44576.677083333336 | 30.59 |
| 44576.6875 | 30.61 |
| 44576.697916666664 | 30.58 |
| 44576.708333333336 | 30.53 |
| 44576.71875 | 30.54 |
| 44576.729166666664 | 30.42 |
| 44576.739583333336 | 30.23 |
| 44576.75 | 30.13 |
| 44576.760416666664 | 30.07 |
| 44576.770833333336 | 30.01 |
| 44576.78125 | 30 |
| 44576.791666666664 | 30 |
| 44576.802083333336 | 30.09 |
| 44576.8125 | 30.14 |
| 44576.822916666664 | 30.16 |
| 44576.833333333336 | 30.24 |
| 44576.84375 | 30.3 |
| 44576.854166666664 | 30.41 |
| 44576.864583333336 | 30.52 |
| 44576.875 | 30.66 |
| 44576.885416666664 | 30.76 |
| 44576.895833333336 | 30.87 |
| 44576.90625 | 30.89 |
| 44576.916666666664 | 30.88 |
| 44576.927083333336 | 30.89 |
| 44576.9375 | 30.89 |
| 44576.947916666664 | 30.9 |
| 44576.958333333336 | 30.91 |
| 44576.96875 | 30.92 |
| 44576.979166666664 | 30.92 |
| 44576.989583333336 | 30.92 |
| 44577.0 | 30.92 |
| 44577.010416666664 | 30.9 |
| 44577.020833333336 | 30.87 |
| 44577.03125 | 30.89 |
| 44577.041666666664 | 30.86 |
| 44577.052083333336 | 30.87 |
| 44577.0625 | 30.83 |
| 44577.072916666664 | 30.84 |
| 44577.083333333336 | 30.84 |
| 44577.09375 | 30.81 |
| 44577.104166666664 | 30.79 |
| 44577.114583333336 | 30.73 |
| 44577.125 | 30.7 |
| 44577.135416666664 | 30.68 |
| 44577.145833333336 | 30.64 |
| 44577.15625 | 30.59 |
| 44577.166666666664 | 30.56 |
| 44577.177083333336 | 30.38 |
| 44577.1875 | 30.38 |
| 44577.197916666664 | 30.31 |
| 44577.208333333336 | 30.19 |
| 44577.21875 | 30.05 |
| 44577.229166666664 | 29.99 |
| 44577.239583333336 | 29.9 |
| 44577.25 | 29.83 |
| 44577.260416666664 | 29.81 |
| 44577.270833333336 | 29.94 |
| 44577.28125 | 29.97 |
| 44577.291666666664 | 30 |
| 44577.302083333336 | 30.06 |
| 44577.3125 | 30.17 |
| 44577.322916666664 | 30.28 |
| 44577.333333333336 | 30.41 |
| 44577.34375 | 30.59 |
| 44577.354166666664 | 30.68 |
| 44577.364583333336 | 30.7 |
| 44577.375 | 30.76 |
| 44577.385416666664 | 30.83 |
| 44577.395833333336 | 30.87 |
| 44577.40625 | 30.89 |
| 44577.416666666664 | 30.9 |
| 44577.427083333336 | 30.89 |
| 44577.4375 | 30.9 |
| 44577.447916666664 | 30.92 |
| 44577.458333333336 | 30.99 |
| 44577.46875 | 31.04 |
| 44577.479166666664 | 31.08 |
| 44577.489583333336 | 31.11 |
| 44577.5 | 31.13 |
| 44577.510416666664 | 31.14 |
| 44577.520833333336 | 31.15 |
| 44577.53125 | 31.17 |
| 44577.541666666664 | 31.18 |
| 44577.552083333336 | 31.18 |
| 44577.5625 | 31.07 |
| 44577.572916666664 | 31.05 |
| 44577.583333333336 | 31.09 |
| 44577.59375 | 31.06 |
| 44577.604166666664 | 31.05 |
| 44577.614583333336 | 31.01 |
| 44577.625 | 31.04 |
| 44577.635416666664 | 31.01 |
| 44577.645833333336 | 30.96 |
| 44577.65625 | 30.83 |
| 44577.666666666664 | 30.81 |
| 44577.677083333336 | 30.76 |
| 44577.6875 | 30.72 |
| 44577.697916666664 | 30.72 |
| 44577.708333333336 | 30.69 |
| 44577.71875 | 30.66 |
| 44577.729166666664 | 30.65 |
| 44577.739583333336 | 30.58 |
| 44577.75 | 30.49 |
| 44577.760416666664 | 30.41 |
| 44577.770833333336 | 30.23 |
| 44577.78125 | 30.18 |
| 44577.791666666664 | 30.12 |
| 44577.802083333336 | 30.09 |
| 44577.8125 | 30.08 |
| 44577.822916666664 | 30.08 |
| 44577.833333333336 | 30.13 |
| 44577.84375 | 30.14 |
| 44577.854166666664 | 30.12 |
| 44577.864583333336 | 30.15 |
| 44577.875 | 30.27 |
| 44577.885416666664 | 30.39 |
| 44577.895833333336 | 30.48 |
| 44577.90625 | 30.58 |
| 44577.916666666664 | 30.72 |
| 44577.927083333336 | 30.8 |
| 44577.9375 | 30.84 |
| 44577.947916666664 | 30.87 |
| 44577.958333333336 | 30.88 |
| 44577.96875 | 30.92 |
| 44577.979166666664 | 30.96 |
| 44577.989583333336 | 30.97 |
| 44578.0 | 31.02 |
| 44578.010416666664 | 31.02 |
| 44578.020833333336 | 31.03 |
| 44578.03125 | 30.89 |
| 44578.041666666664 | 30.84 |
| 44578.052083333336 | 30.6 |
| 44578.0625 | 30.61 |
| 44578.072916666664 | 30.31 |
| 44578.083333333336 | 30.25 |
| 44578.09375 | 30.29 |
| 44578.104166666664 | 30.21 |
| 44578.114583333336 | 30.1 |
| 44578.125 | 30.04 |
| 44578.135416666664 | 30.16 |
| 44578.145833333336 | 30.05 |
| 44578.15625 | 29.96 |
| 44578.166666666664 | 29.72 |
| 44578.177083333336 | 29.7 |
| 44578.1875 | 29.78 |
| 44578.197916666664 | 29.58 |
| 44578.208333333336 | 29.49 |
| 44578.21875 | 29.41 |
| 44578.229166666664 | 29.33 |
| 44578.239583333336 | 29.45 |
| 44578.25 | 29.11 |
| 44578.260416666664 | 29.28 |
| 44578.270833333336 | 29.39 |
| 44578.28125 | 29.31 |
| 44578.291666666664 | 29.33 |
| 44578.302083333336 | 29.22 |
| 44578.3125 | 29.15 |
| 44578.322916666664 | 29.23 |
| 44578.333333333336 | 29.26 |
| 44578.34375 | 29.33 |
| 44578.354166666664 | 29.5 |
| 44578.364583333336 | 29.67 |
| 44578.375 | 29.84 |
| 44578.385416666664 | 29.86 |
| 44578.395833333336 | 29.82 |
| 44578.40625 | 29.82 |
| 44578.416666666664 | 29.94 |
| 44578.427083333336 | 30.06 |
| 44578.4375 | 30.13 |
| 44578.447916666664 | 30.19 |
| 44578.458333333336 | 30.23 |
| 44578.46875 | 30.31 |
| 44578.479166666664 | 30.33 |
| 44578.489583333336 | 30.17 |
| 44578.5 | 30.21 |
| 44578.510416666664 | 30.17 |
| 44578.520833333336 | 30.23 |
| 44578.53125 | 30.23 |
| 44578.541666666664 | 30.27 |
| 44578.552083333336 | 30.32 |
| 44578.5625 | 30.33 |
| 44578.572916666664 | 30.34 |
| 44578.583333333336 | 30.34 |
| 44578.59375 | 30.32 |
| 44578.604166666664 | 30.29 |
| 44578.614583333336 | 30.3 |
| 44578.625 | 30.3 |
| 44578.635416666664 | 30.27 |
| 44578.645833333336 | 30.16 |
| 44578.65625 | 30.08 |
| 44578.666666666664 | 29.85 |
| 44578.677083333336 | 29.78 |
| 44578.6875 | 29.88 |
| 44578.697916666664 | 29.9 |
| 44578.708333333336 | 29.85 |
| 44578.71875 | 29.28 |
| 44578.729166666664 | 28.78 |
| 44578.739583333336 | 28.41 |
| 44578.75 | 28.03 |
| 44578.760416666664 | 28 |
| 44578.770833333336 | 27.98 |
| 44578.78125 | 27.93 |
| 44578.791666666664 | 27.93 |
| 44578.802083333336 | 27.87 |
| 44578.8125 | 27.76 |
| 44578.822916666664 | 27.7 |
| 44578.833333333336 | 27.81 |
| 44578.84375 | 27.79 |
| 44578.854166666664 | 27.91 |
| 44578.864583333336 | 27.92 |
| 44578.875 | 27.97 |
| 44578.885416666664 | 28.64 |
| 44578.895833333336 | 29.09 |
| 44578.90625 | 29.22 |
| 44578.916666666664 | 29.13 |
| 44578.927083333336 | 29.19 |
| 44578.9375 | 29.36 |
| 44578.947916666664 | 29.45 |
| 44578.958333333336 | 29.48 |
| 44578.96875 | 29.59 |
| 44578.979166666664 | 29.72 |
| 44578.989583333336 | 29.83 |
| 44579.0 | 29.93 |
| 44579.010416666664 | 30.11 |
| 44579.020833333336 | 30.22 |
| 44579.03125 | 30.22 |
| 44579.041666666664 | 30.27 |
| 44579.052083333336 | 30.34 |
| 44579.0625 | 30.32 |
| 44579.072916666664 | 30.3 |
| 44579.083333333336 | 30.25 |
| 44579.09375 | 30.27 |
| 44579.104166666664 | 30.25 |
| 44579.114583333336 | 30.2 |
| 44579.125 | 30.18 |
| 44579.135416666664 | 30.14 |
| 44579.145833333336 | 29.97 |
| 44579.15625 | 29.22 |
| 44579.166666666664 | 28.86 |
| 44579.177083333336 | 28.57 |
| 44579.1875 | 28.4 |
| 44579.197916666664 | 28.21 |
| 44579.208333333336 | 27.76 |
| 44579.21875 | 27.12 |
| 44579.229166666664 | 26.43 |
| 44579.239583333336 | 26.14 |
| 44579.25 | 25.94 |
| 44579.260416666664 | 25.8 |
| 44579.270833333336 | 25.84 |
| 44579.28125 | 25.44 |
| 44579.291666666664 | 25.25 |
| 44579.302083333336 | 24.85 |
| 44579.3125 | 25.19 |
| 44579.322916666664 | 25.35 |
| 44579.333333333336 | 25.5 |
| 44579.34375 | 25.95 |
| 44579.354166666664 | 26.09 |
| 44579.364583333336 | 26.28 |
| 44579.375 | 26.56 |
| 44579.385416666664 | 28.36 |
| 44579.395833333336 | 29.08 |
| 44579.40625 | 29.54 |
| 44579.416666666664 | 29.62 |
| 44579.427083333336 | 29.49 |
| 44579.4375 | 29.29 |
| 44579.447916666664 | 29.48 |
| 44579.458333333336 | 29.53 |
| 44579.46875 | 29.61 |
| 44579.479166666664 | 29.81 |
| 44579.489583333336 | 30.01 |
| 44579.5 | 30.2 |
| 44579.510416666664 | 30.33 |
| 44579.520833333336 | 30.36 |
| 44579.53125 | 30.38 |
| 44579.541666666664 | 30.4 |
| 44579.552083333336 | 30.41 |
| 44579.5625 | 30.4 |
| 44579.572916666664 | 30.4 |
| 44579.583333333336 | 30.4 |
| 44579.59375 | 30.41 |
| 44579.604166666664 | 30.37 |
| 44579.614583333336 | 30.35 |
| 44579.625 | 30.32 |
| 44579.635416666664 | 30.31 |
| 44579.645833333336 | 30.3 |
| 44579.65625 | 30.29 |
| 44579.666666666664 | 30.23 |
| 44579.677083333336 | 30.19 |
| 44579.6875 | 30.21 |
| 44579.697916666664 | 29.94 |
| 44579.708333333336 | 29.61 |
| 44579.71875 | 29.22 |
| 44579.729166666664 | 28.52 |
| 44579.739583333336 | 28 |
| 44579.75 | 27.57 |
| 44579.760416666664 | 27.11 |
| 44579.770833333336 | 26.85 |
| 44579.78125 | 26.76 |
| 44579.791666666664 | 26.54 |
| 44579.802083333336 | 26.4 |
| 44579.8125 | 26.25 |
| 44579.822916666664 | 26.3 |
| 44579.833333333336 | 26.25 |
| 44579.84375 | 26.29 |
| 44579.854166666664 | 26.33 |
| 44579.864583333336 | 26.32 |
| 44579.875 | 26.26 |
| 44579.885416666664 | 26.31 |
| 44579.895833333336 | 26.5 |
| 44579.90625 | 27.26 |
| 44579.916666666664 | 27.87 |
| 44579.927083333336 | 28.12 |
| 44579.9375 | 28.83 |
| 44579.947916666664 | 29.13 |
| 44579.958333333336 | 28.96 |
| 44579.96875 | 29.04 |
| 44579.979166666664 | 29.22 |
| 44579.989583333336 | 29.37 |
| 44580.0 | 29.6 |
| 44580.010416666664 | 29.76 |
| 44580.020833333336 | 29.92 |
| 44580.03125 | 30.06 |
| 44580.041666666664 | 30.17 |
| 44580.052083333336 | 30.26 |
| 44580.0625 | 30.31 |
| 44580.072916666664 | 30.29 |
| 44580.083333333336 | 30.35 |
| 44580.09375 | 30.43 |
| 44580.104166666664 | 30.36 |
| 44580.114583333336 | 30.33 |
| 44580.125 | 30.25 |
| 44580.135416666664 | 30.23 |
| 44580.145833333336 | 30.14 |
| 44580.15625 | 29.83 |
| 44580.166666666664 | 29.79 |
| 44580.177083333336 | 29.77 |
| 44580.1875 | 29.47 |
| 44580.197916666664 | 29.05 |
| 44580.208333333336 | 28.59 |
| 44580.21875 | 28.22 |
| 44580.229166666664 | 27.69 |
| 44580.239583333336 | 27.49 |
| 44580.25 | 27.33 |
| 44580.260416666664 | 26.96 |
| 44580.270833333336 | 26.79 |
| 44580.28125 | 26.68 |
| 44580.291666666664 | 26.64 |
| 44580.302083333336 | 26.61 |
| 44580.3125 | 26.65 |
| 44580.322916666664 | 26.58 |
| 44580.333333333336 | 26.53 |
| 44580.34375 | 26.57 |
| 44580.354166666664 | 26.67 |
| 44580.364583333336 | 26.67 |
| 44580.375 | 26.66 |
| 44580.385416666664 | 26.78 |
| 44580.395833333336 | 27.09 |
| 44580.40625 | 27.79 |
| 44580.416666666664 | 28.14 |
| 44580.427083333336 | 28.43 |
| 44580.4375 | 28.87 |
| 44580.447916666664 | 29.1 |
| 44580.458333333336 | 29.33 |
| 44580.46875 | 29.55 |
| 44580.479166666664 | 29.77 |
| 44580.489583333336 | 29.9 |
| 44580.5 | 30.02 |
| 44580.510416666664 | 30.13 |
| 44580.520833333336 | 30.22 |
| 44580.53125 | 30.3 |
| 44580.541666666664 | 30.36 |
| 44580.552083333336 | 30.41 |
| 44580.5625 | 30.44 |
| 44580.572916666664 | 30.46 |
| 44580.583333333336 | 30.48 |
| 44580.59375 | 30.5 |
| 44580.604166666664 | 30.5 |
| 44580.614583333336 | 30.5 |
| 44580.625 | 30.45 |
| 44580.635416666664 | 30.32 |
| 44580.645833333336 | 30.34 |
| 44580.65625 | 30.22 |
| 44580.666666666664 | 30.35 |
| 44580.677083333336 | 30.11 |
| 44580.6875 | 30.16 |
| 44580.697916666664 | 30.16 |
| 44580.708333333336 | 30.16 |
| 44580.71875 | 29.82 |
| 44580.729166666664 | 29.28 |
| 44580.739583333336 | 28.6 |
| 44580.75 | 28.24 |
| 44580.760416666664 | 28 |
| 44580.770833333336 | 27.81 |
| 44580.78125 | 27.73 |
| 44580.791666666664 | 27.59 |
| 44580.802083333336 | 27.4 |
| 44580.8125 | 27.23 |
| 44580.833333333336 | 26.81 |
| 44580.84375 | 27.12 |
| 44580.854166666664 | 27.08 |
| 44580.864583333336 | 27.08 |
| 44580.875 | 27.13 |
| 44580.885416666664 | 27.23 |
| 44580.895833333336 | 27.19 |
| 44580.90625 | 27.25 |
| 44580.916666666664 | 27.43 |
| 44580.927083333336 | 27.47 |
| 44580.9375 | 28.03 |
| 44580.947916666664 | 28.53 |
| 44580.958333333336 | 28.69 |
| 44580.96875 | 28.81 |
| 44580.979166666664 | 29.02 |
| 44580.989583333336 | 29.25 |
| 44581.0 | 29.47 |
| 44581.010416666664 | 29.68 |
| 44581.020833333336 | 29.88 |
| 44581.03125 | 30.05 |
| 44581.041666666664 | 30.18 |
| 44581.052083333336 | 30.26 |
| 44581.0625 | 30.3 |
| 44581.072916666664 | 30.33 |
| 44581.083333333336 | 30.36 |
| 44581.09375 | 30.39 |
| 44581.104166666664 | 30.42 |
| 44581.114583333336 | 30.43 |
| 44581.125 | 30.48 |
| 44581.135416666664 | 30.43 |
| 44581.145833333336 | 30.26 |
| 44581.15625 | 30.36 |
| 44581.166666666664 | 30.3 |
| 44581.177083333336 | 30.27 |
| 44581.1875 | 30.24 |
| 44581.197916666664 | 30.28 |
| 44581.208333333336 | 30.11 |
| 44581.21875 | 29.56 |
| 44581.229166666664 | 29.4 |
| 44581.239583333336 | 29.16 |
| 44581.25 | 28.71 |
| 44581.260416666664 | 28.46 |
| 44581.270833333336 | 28.17 |
| 44581.28125 | 27.87 |
| 44581.291666666664 | 27.57 |
| 44581.302083333336 | 27.47 |
| 44581.3125 | 27.38 |
| 44581.322916666664 | 27.29 |
| 44581.333333333336 | 27.22 |
| 44581.34375 | 27.2 |
| 44581.354166666664 | 27.22 |
| 44581.364583333336 | 27.3 |
| 44581.375 | 27.38 |
| 44581.385416666664 | 27.37 |
| 44581.395833333336 | 27.41 |
| 44581.40625 | 27.5 |
| 44581.416666666664 | 27.82 |
| 44581.427083333336 | 28.37 |
| 44581.4375 | 28.69 |
| 44581.447916666664 | 29.04 |
| 44581.458333333336 | 29.3 |
| 44581.46875 | 29.55 |
| 44581.479166666664 | 29.83 |
| 44581.489583333336 | 29.98 |
| 44581.5 | 30.14 |
| 44581.510416666664 | 30.26 |
| 44581.520833333336 | 30.33 |
| 44581.53125 | 30.4 |
| 44581.541666666664 | 30.45 |
| 44581.552083333336 | 30.49 |
| 44581.5625 | 30.52 |
| 44581.572916666664 | 30.56 |
| 44581.583333333336 | 30.57 |
| 44581.59375 | 30.6 |
| 44581.604166666664 | 30.6 |
| 44581.614583333336 | 30.62 |
| 44581.625 | 30.62 |
| 44581.635416666664 | 30.62 |
| 44581.645833333336 | 30.55 |
| 44581.65625 | 30.55 |
| 44581.666666666664 | 30.55 |
| 44581.677083333336 | 30.55 |
| 44581.6875 | 30.57 |
| 44581.697916666664 | 30.49 |
| 44581.708333333336 | 30.47 |
| 44581.71875 | 30.46 |
| 44581.729166666664 | 30.39 |
| 44581.739583333336 | 30.29 |
| 44581.75 | 30.03 |
| 44581.760416666664 | 29.82 |
| 44581.770833333336 | 29.51 |
| 44581.78125 | 29.11 |
| 44581.791666666664 | 28.64 |
| 44581.802083333336 | 28.18 |
| 44581.8125 | 27.66 |
| 44581.822916666664 | 27.22 |
| 44581.833333333336 | 26.92 |
| 44581.84375 | 26.76 |
| 44581.854166666664 | 26.67 |
| 44581.864583333336 | 26.65 |
| 44581.875 | 26.67 |
| 44581.885416666664 | 26.61 |
| 44581.895833333336 | 26.64 |
| 44581.90625 | 26.69 |
| 44581.916666666664 | 26.72 |
| 44581.927083333336 | 26.75 |
| 44581.9375 | 27.03 |
| 44581.947916666664 | 27.61 |
| 44581.958333333336 | 28.4 |
| 44581.96875 | 28.73 |
| 44581.979166666664 | 29.09 |
| 44581.989583333336 | 29.12 |
| 44582.0 | 29.21 |
| 44582.010416666664 | 29.26 |
| 44582.020833333336 | 29.43 |
| 44582.03125 | 29.55 |
| 44582.041666666664 | 29.67 |
| 44582.052083333336 | 29.81 |
| 44582.0625 | 29.95 |
| 44582.072916666664 | 30.06 |
| 44582.083333333336 | 30.15 |
| 44582.09375 | 30.2 |
| 44582.104166666664 | 30.27 |
| 44582.114583333336 | 30.34 |
| 44582.125 | 30.39 |
| 44582.135416666664 | 30.43 |
| 44582.145833333336 | 30.42 |
| 44582.15625 | 30.35 |
| 44582.166666666664 | 30.49 |
| 44582.177083333336 | 30.43 |
| 44582.1875 | 30.41 |
| 44582.197916666664 | 30.38 |
| 44582.208333333336 | 30.16 |
| 44582.21875 | 30.19 |
| 44582.229166666664 | 29.91 |
| 44582.239583333336 | 29.91 |
| 44582.25 | 29.74 |
| 44582.260416666664 | 29.75 |
| 44582.270833333336 | 29.49 |
| 44582.28125 | 29.25 |
| 44582.291666666664 | 28.88 |
| 44582.302083333336 | 28.71 |
| 44582.3125 | 28.53 |
| 44582.322916666664 | 28.43 |
| 44582.333333333336 | 28.25 |
| 44582.34375 | 28.06 |
| 44582.354166666664 | 27.85 |
| 44582.364583333336 | 27.68 |
| 44582.375 | 27.52 |
| 44582.385416666664 | 27.41 |
| 44582.395833333336 | 27.45 |
| 44582.40625 | 27.56 |
| 44582.416666666664 | 27.68 |
| 44582.427083333336 | 27.74 |
| 44582.4375 | 27.9 |
| 44582.447916666664 | 28.14 |
| 44582.458333333336 | 28.56 |
| 44582.46875 | 29.07 |
| 44582.479166666664 | 29.26 |
| 44582.489583333336 | 29.27 |
| 44582.5 | 29.33 |
| 44582.510416666664 | 29.48 |
| 44582.520833333336 | 29.65 |
| 44582.53125 | 29.81 |
| 44582.541666666664 | 29.97 |
| 44582.552083333336 | 30.11 |
| 44582.5625 | 30.21 |
| 44582.572916666664 | 30.28 |
| 44582.583333333336 | 30.33 |
| 44582.59375 | 30.38 |
| 44582.604166666664 | 30.45 |
| 44582.614583333336 | 30.51 |
| 44582.625 | 30.57 |
| 44582.635416666664 | 30.6 |
| 44582.645833333336 | 30.63 |
| 44582.65625 | 30.64 |
| 44582.666666666664 | 30.65 |
| 44582.677083333336 | 30.67 |
| 44582.6875 | 30.56 |
| 44582.697916666664 | 30.49 |
| 44582.708333333336 | 30.58 |
| 44582.71875 | 30.54 |
| 44582.729166666664 | 30.49 |
| 44582.739583333336 | 30.49 |
| 44582.75 | 30.41 |
| 44582.760416666664 | 30.39 |
| 44582.770833333336 | 30.19 |
| 44582.78125 | 30.12 |
| 44582.791666666664 | 30 |
| 44582.802083333336 | 29.84 |
| 44582.8125 | 29.73 |
| 44582.822916666664 | 29.72 |
| 44582.833333333336 | 29.59 |
| 44582.84375 | 29.53 |
| 44582.854166666664 | 29.34 |
| 44582.864583333336 | 28.97 |
| 44582.875 | 28.78 |
| 44582.885416666664 | 28.62 |
| 44582.895833333336 | 28.45 |
| 44582.90625 | 28.34 |
| 44582.916666666664 | 28.26 |
| 44582.927083333336 | 28.27 |
| 44582.9375 | 28.37 |
| 44582.947916666664 | 28.41 |
| 44582.958333333336 | 28.46 |
| 44582.96875 | 28.55 |
| 44582.979166666664 | 28.68 |
| 44582.989583333336 | 29.03 |
| 44583.0 | 29.36 |
| 44583.010416666664 | 29.71 |
| 44583.020833333336 | 29.84 |
| 44583.03125 | 29.85 |
| 44583.041666666664 | 29.84 |
| 44583.052083333336 | 29.9 |
| 44583.0625 | 29.98 |
| 44583.072916666664 | 30.06 |
| 44583.083333333336 | 30.18 |
| 44583.09375 | 30.26 |
| 44583.104166666664 | 30.32 |
| 44583.114583333336 | 30.27 |
| 44583.125 | 30.3 |
| 44583.135416666664 | 30.34 |
| 44583.145833333336 | 30.39 |
| 44583.15625 | 30.41 |
| 44583.166666666664 | 30.42 |
| 44583.177083333336 | 30.44 |
| 44583.1875 | 30.46 |
| 44583.197916666664 | 30.54 |
| 44583.208333333336 | 30.46 |
| 44583.21875 | 30.45 |
| 44583.229166666664 | 30.39 |
| 44583.239583333336 | 30.36 |
| 44583.25 | 30.3 |
| 44583.260416666664 | 30.24 |
| 44583.270833333336 | 30.18 |
| 44583.28125 | 30.1 |
| 44583.291666666664 | 29.97 |
| 44583.302083333336 | 29.91 |
| 44583.3125 | 29.82 |
| 44583.322916666664 | 29.8 |
| 44583.333333333336 | 29.77 |
| 44583.34375 | 29.65 |
| 44583.354166666664 | 29.36 |
| 44583.364583333336 | 29.29 |
| 44583.375 | 29.1 |
| 44583.385416666664 | 28.94 |
| 44583.395833333336 | 28.83 |
| 44583.40625 | 28.7 |
| 44583.416666666664 | 28.66 |
| 44583.427083333336 | 28.67 |
| 44583.4375 | 28.65 |
| 44583.447916666664 | 28.61 |
| 44583.458333333336 | 28.74 |
| 44583.46875 | 28.89 |
| 44583.479166666664 | 28.91 |
| 44583.489583333336 | 28.99 |
| 44583.5 | 29.19 |
| 44583.510416666664 | 29.5 |
| 44583.520833333336 | 29.73 |
| 44583.53125 | 29.84 |
| 44583.541666666664 | 29.87 |
| 44583.552083333336 | 29.98 |
| 44583.5625 | 30.08 |
| 44583.572916666664 | 30.13 |
| 44583.583333333336 | 30.12 |
| 44583.59375 | 30.15 |
| 44583.604166666664 | 30.21 |
| 44583.614583333336 | 30.26 |
| 44583.625 | 30.3 |
| 44583.635416666664 | 30.35 |
| 44583.645833333336 | 30.41 |
| 44583.65625 | 30.48 |
| 44583.666666666664 | 30.56 |
| 44583.677083333336 | 30.61 |
| 44583.6875 | 30.64 |
| 44583.697916666664 | 30.63 |
| 44583.708333333336 | 30.68 |
| 44583.71875 | 30.62 |
| 44583.729166666664 | 30.62 |
| 44583.739583333336 | 30.55 |
| 44583.75 | 30.42 |
| 44583.760416666664 | 30.42 |
| 44583.770833333336 | 30.37 |
| 44583.78125 | 30.29 |
| 44583.791666666664 | 30.15 |
| 44583.802083333336 | 30.12 |
| 44583.8125 | 30.01 |
| 44583.822916666664 | 29.87 |
| 44583.833333333336 | 29.84 |
| 44583.84375 | 29.79 |
| 44583.854166666664 | 29.74 |
| 44583.864583333336 | 29.69 |
| 44583.875 | 29.52 |
| 44583.885416666664 | 29.41 |
| 44583.895833333336 | 29.19 |
| 44583.90625 | 28.95 |
| 44583.916666666664 | 28.81 |
| 44583.927083333336 | 28.72 |
| 44583.9375 | 28.69 |
| 44583.947916666664 | 28.66 |
| 44583.958333333336 | 28.68 |
| 44583.96875 | 28.76 |
| 44583.979166666664 | 28.8 |
| 44583.989583333336 | 28.86 |
| 44584.0 | 28.9 |
| 44584.010416666664 | 29.06 |
| 44584.020833333336 | 29.16 |
| 44584.03125 | 29.34 |
| 44584.041666666664 | 29.59 |
| 44584.052083333336 | 29.85 |
| 44584.0625 | 30.2 |
| 44584.072916666664 | 30.25 |
| 44584.083333333336 | 30.21 |
| 44584.09375 | 30.25 |
| 44584.104166666664 | 30.29 |
| 44584.114583333336 | 30.31 |
| 44584.125 | 30.33 |
| 44584.135416666664 | 30.35 |
| 44584.145833333336 | 30.37 |
| 44584.15625 | 30.39 |
| 44584.166666666664 | 30.4 |
| 44584.177083333336 | 30.41 |
| 44584.1875 | 30.46 |
| 44584.197916666664 | 30.5 |
| 44584.208333333336 | 30.57 |
| 44584.21875 | 30.74 |
| 44584.229166666664 | 30.62 |
| 44584.239583333336 | 30.54 |
| 44584.25 | 30.44 |
| 44584.260416666664 | 30.49 |
| 44584.270833333336 | 30.45 |
| 44584.28125 | 30.43 |
| 44584.291666666664 | 30.36 |
| 44584.302083333336 | 30.29 |
| 44584.3125 | 30.22 |
| 44584.322916666664 | 30.11 |
| 44584.333333333336 | 29.97 |
| 44584.34375 | 29.99 |
| 44584.354166666664 | 29.89 |
| 44584.364583333336 | 29.79 |
| 44584.375 | 29.58 |
| 44584.385416666664 | 29.43 |
| 44584.395833333336 | 29.27 |
| 44584.40625 | 29.13 |
| 44584.416666666664 | 29.01 |
| 44584.427083333336 | 28.9 |
| 44584.4375 | 28.85 |
| 44584.447916666664 | 28.77 |
| 44584.458333333336 | 28.79 |
| 44584.46875 | 28.78 |
| 44584.479166666664 | 28.84 |
| 44584.489583333336 | 28.89 |
| 44584.5 | 28.94 |
| 44584.510416666664 | 29.02 |
| 44584.520833333336 | 29.15 |
| 44584.53125 | 29.39 |
| 44584.541666666664 | 29.79 |
| 44584.552083333336 | 30.02 |
| 44584.5625 | 30.16 |
| 44584.572916666664 | 30.3 |
| 44584.583333333336 | 30.39 |
| 44584.59375 | 30.44 |
| 44584.604166666664 | 30.48 |
| 44584.614583333336 | 30.5 |
| 44584.625 | 30.5 |
| 44584.635416666664 | 30.49 |
| 44584.645833333336 | 30.51 |
| 44584.65625 | 30.56 |
| 44584.666666666664 | 30.64 |
| 44584.677083333336 | 30.71 |
| 44584.6875 | 30.76 |
| 44584.697916666664 | 30.78 |
| 44584.708333333336 | 30.78 |
| 44584.71875 | 30.8 |
| 44584.729166666664 | 30.8 |
| 44584.739583333336 | 30.73 |
| 44584.75 | 30.73 |
| 44584.760416666664 | 30.69 |
| 44584.770833333336 | 30.69 |
| 44584.78125 | 30.53 |
| 44584.791666666664 | 30.49 |
| 44584.802083333336 | 30.57 |
| 44584.8125 | 30.47 |
| 44584.822916666664 | 30.5 |
| 44584.833333333336 | 30.35 |
| 44584.84375 | 30.14 |
| 44584.854166666664 | 30.18 |
| 44584.864583333336 | 30.06 |
| 44584.875 | 29.96 |
| 44584.885416666664 | 29.88 |
| 44584.895833333336 | 29.81 |
| 44584.90625 | 29.69 |
| 44584.916666666664 | 29.6 |
| 44584.927083333336 | 29.54 |
| 44584.9375 | 29.38 |
| 44584.947916666664 | 29.22 |
| 44584.958333333336 | 29.17 |
| 44584.96875 | 29.13 |
| 44584.979166666664 | 29.1 |
| 44584.989583333336 | 29.14 |
| 44585.0 | 29.17 |
| 44585.010416666664 | 29.24 |
| 44585.020833333336 | 29.29 |
| 44585.03125 | 29.36 |
| 44585.041666666664 | 29.51 |
| 44585.052083333336 | 29.66 |
| 44585.0625 | 29.81 |
| 44585.072916666664 | 30.07 |
| 44585.083333333336 | 30.23 |
| 44585.09375 | 30.35 |
| 44585.104166666664 | 30.38 |
| 44585.114583333336 | 30.44 |
| 44585.125 | 30.48 |
| 44585.135416666664 | 30.51 |
| 44585.145833333336 | 30.53 |
| 44585.15625 | 30.56 |
| 44585.166666666664 | 30.58 |
| 44585.177083333336 | 30.6 |
| 44585.1875 | 30.65 |
| 44585.197916666664 | 30.7 |
| 44585.208333333336 | 30.74 |
| 44585.21875 | 30.79 |
| 44585.229166666664 | 30.82 |
| 44585.239583333336 | 30.83 |
| 44585.25 | 30.88 |
| 44585.260416666664 | 30.79 |
| 44585.270833333336 | 30.81 |
| 44585.28125 | 30.73 |
| 44585.291666666664 | 30.77 |
| 44585.302083333336 | 30.67 |
| 44585.3125 | 30.61 |
| 44585.322916666664 | 30.69 |
| 44585.333333333336 | 30.55 |
| 44585.34375 | 30.51 |
| 44585.354166666664 | 30.43 |
| 44585.364583333336 | 30.24 |
| 44585.375 | 30.15 |
| 44585.385416666664 | 30.03 |
| 44585.395833333336 | 29.94 |
| 44585.40625 | 29.74 |
| 44585.416666666664 | 29.49 |
| 44585.427083333336 | 29.32 |
| 44585.4375 | 29.13 |
| 44585.447916666664 | 28.87 |
| 44585.458333333336 | 28.71 |
| 44585.46875 | 28.6 |
| 44585.479166666664 | 28.58 |
| 44585.489583333336 | 28.6 |
| 44585.5 | 28.63 |
| 44585.510416666664 | 28.87 |
| 44585.520833333336 | 28.93 |
| 44585.53125 | 29.02 |
| 44585.541666666664 | 29.28 |
| 44585.552083333336 | 29.44 |
| 44585.5625 | 29.67 |
| 44585.572916666664 | 29.96 |
| 44585.583333333336 | 30.27 |
| 44585.59375 | 30.43 |
| 44585.604166666664 | 30.48 |
| 44585.614583333336 | 30.55 |
| 44585.625 | 30.61 |
| 44585.635416666664 | 30.63 |
| 44585.645833333336 | 30.65 |
| 44585.65625 | 30.66 |
| 44585.666666666664 | 30.67 |
| 44585.677083333336 | 30.68 |
| 44585.6875 | 30.7 |
| 44585.697916666664 | 30.74 |
| 44585.708333333336 | 30.78 |
| 44585.71875 | 30.82 |
| 44585.729166666664 | 30.85 |
| 44585.739583333336 | 30.87 |
| 44585.75 | 30.87 |
| 44585.760416666664 | 30.92 |
| 44585.770833333336 | 30.75 |
| 44585.78125 | 30.74 |
| 44585.791666666664 | 30.72 |
| 44585.802083333336 | 30.8 |
| 44585.8125 | 30.84 |
| 44585.822916666664 | 30.81 |
| 44585.833333333336 | 30.81 |
| 44585.84375 | 30.73 |
| 44585.854166666664 | 30.59 |
| 44585.864583333336 | 30.45 |
| 44585.875 | 30.38 |
| 44585.885416666664 | 30.22 |
| 44585.895833333336 | 30.19 |
| 44585.90625 | 30.14 |
| 44585.916666666664 | 30.03 |
| 44585.927083333336 | 29.8 |
| 44585.9375 | 29.67 |
| 44585.947916666664 | 29.55 |
| 44585.958333333336 | 29.45 |
| 44585.96875 | 29.4 |
| 44585.979166666664 | 29.39 |
| 44585.989583333336 | 29.3 |
| 44586.0 | 29.26 |
| 44586.010416666664 | 29.22 |
| 44586.020833333336 | 29.18 |
| 44586.03125 | 29.08 |
| 44586.041666666664 | 29.3 |
| 44586.052083333336 | 29.33 |
| 44586.0625 | 29.35 |
| 44586.072916666664 | 29.45 |
| 44586.083333333336 | 29.55 |
| 44586.09375 | 29.7 |
| 44586.104166666664 | 29.95 |
| 44586.114583333336 | 30.25 |
| 44586.125 | 30.48 |
| 44586.135416666664 | 30.61 |
| 44586.145833333336 | 30.68 |
| 44586.15625 | 30.71 |
| 44586.166666666664 | 30.73 |
| 44586.177083333336 | 30.72 |
| 44586.1875 | 30.73 |
| 44586.197916666664 | 30.75 |
| 44586.208333333336 | 30.77 |
| 44586.21875 | 30.79 |
| 44586.229166666664 | 30.82 |
| 44586.239583333336 | 30.85 |
| 44586.25 | 30.87 |
| 44586.260416666664 | 30.9 |
| 44586.270833333336 | 30.92 |
| 44586.28125 | 30.94 |
| 44586.291666666664 | 30.91 |
| 44586.302083333336 | 30.87 |
| 44586.3125 | 30.78 |
| 44586.322916666664 | 30.79 |
| 44586.333333333336 | 30.79 |
| 44586.34375 | 30.74 |
| 44586.354166666664 | 30.79 |
| 44586.364583333336 | 30.72 |
| 44586.375 | 30.71 |
| 44586.385416666664 | 30.64 |
| 44586.395833333336 | 30.53 |
| 44586.40625 | 30.39 |
| 44586.416666666664 | 30.45 |
| 44586.427083333336 | 30.37 |
| 44586.4375 | 30.24 |
| 44586.447916666664 | 30.04 |
| 44586.458333333336 | 29.75 |
| 44586.46875 | 29.51 |
| 44586.479166666664 | 29.29 |
| 44586.489583333336 | 29.1 |
| 44586.5 | 29.06 |
| 44586.510416666664 | 29.01 |
| 44586.520833333336 | 28.92 |
| 44586.53125 | 28.9 |
| 44586.541666666664 | 28.93 |
| 44586.552083333336 | 29.03 |
| 44586.5625 | 29.05 |
| 44586.572916666664 | 29.07 |
| 44586.583333333336 | 29.14 |
| 44586.59375 | 29.34 |
| 44586.604166666664 | 29.54 |
| 44586.614583333336 | 29.97 |
| 44586.625 | 30.13 |
| 44586.635416666664 | 30.21 |
| 44586.645833333336 | 30.28 |
| 44586.65625 | 30.37 |
| 44586.666666666664 | 30.44 |
| 44586.677083333336 | 30.52 |
| 44586.6875 | 30.58 |
| 44586.697916666664 | 30.62 |
| 44586.708333333336 | 30.65 |
| 44586.71875 | 30.69 |
| 44586.729166666664 | 30.72 |
| 44586.739583333336 | 30.75 |
| 44586.75 | 30.77 |
| 44586.760416666664 | 30.8 |
| 44586.770833333336 | 30.83 |
| 44586.78125 | 30.9 |
| 44586.791666666664 | 30.96 |
| 44586.802083333336 | 30.94 |
| 44586.8125 | 30.88 |
| 44586.822916666664 | 30.84 |
| 44586.833333333336 | 30.82 |
| 44586.84375 | 30.79 |
| 44586.854166666664 | 30.74 |
| 44586.864583333336 | 30.77 |
| 44586.875 | 30.76 |
| 44586.885416666664 | 30.6 |
| 44586.895833333336 | 30.55 |
| 44586.90625 | 30.37 |
| 44586.916666666664 | 30.27 |
| 44586.927083333336 | 30.1 |
| 44586.9375 | 29.87 |
| 44586.947916666664 | 29.58 |
| 44586.958333333336 | 29.29 |
| 44586.96875 | 28.97 |
| 44586.979166666664 | 28.79 |
| 44586.989583333336 | 28.53 |
| 44587.0 | 28.28 |
| 44587.010416666664 | 28 |
| 44587.020833333336 | 27.92 |
| 44587.03125 | 27.72 |
| 44587.041666666664 | 27.67 |
| 44587.052083333336 | 27.68 |
| 44587.0625 | 27.76 |
| 44587.072916666664 | 28.11 |
| 44587.083333333336 | 28.19 |
| 44587.09375 | 28.45 |
| 44587.104166666664 | 28.56 |
| 44587.114583333336 | 29.23 |
| 44587.125 | 29.91 |
| 44587.135416666664 | 30.05 |
| 44587.145833333336 | 30.16 |
| 44587.15625 | 30.35 |
| 44587.166666666664 | 30.41 |
| 44587.177083333336 | 30.57 |
| 44587.1875 | 30.65 |
| 44587.197916666664 | 30.68 |
| 44587.208333333336 | 30.69 |
| 44587.21875 | 30.73 |
| 44587.229166666664 | 30.8 |
| 44587.239583333336 | 30.91 |
| 44587.25 | 30.97 |
| 44587.260416666664 | 31.01 |
| 44587.270833333336 | 31.01 |
| 44587.28125 | 31.03 |
| 44587.291666666664 | 30.99 |
| 44587.302083333336 | 31.08 |
| 44587.3125 | 31.03 |
| 44587.322916666664 | 31.03 |
| 44587.333333333336 | 30.98 |
| 44587.34375 | 31.01 |
| 44587.354166666664 | 31.06 |
| 44587.364583333336 | 31.06 |
| 44587.375 | 31.03 |
| 44587.385416666664 | 31.02 |
| 44587.395833333336 | 31.01 |
| 44587.40625 | 30.98 |
| 44587.416666666664 | 30.92 |
| 44587.427083333336 | 30.92 |
| 44587.4375 | 30.88 |
| 44587.447916666664 | 30.7 |
| 44587.458333333336 | 30.61 |
| 44587.46875 | 30.52 |
| 44587.479166666664 | 30.42 |
| 44587.489583333336 | 30.42 |
| 44587.5 | 30.26 |
| 44587.510416666664 | 30.07 |
| 44587.520833333336 | 29.96 |
| 44587.53125 | 29.73 |
| 44587.541666666664 | 29.5 |
| 44587.552083333336 | 29.33 |
| 44587.5625 | 29.24 |
| 44587.572916666664 | 29.14 |
| 44587.583333333336 | 29.1 |
| 44587.59375 | 29.11 |
| 44587.604166666664 | 29.24 |
| 44587.614583333336 | 29.27 |
| 44587.625 | 29.3 |
| 44587.635416666664 | 29.39 |
| 44587.645833333336 | 29.52 |
| 44587.65625 | 29.87 |
| 44587.666666666664 | 30.2 |
| 44587.677083333336 | 30.35 |
| 44587.6875 | 30.4 |
| 44587.697916666664 | 30.39 |
| 44587.708333333336 | 30.37 |
| 44587.71875 | 30.45 |
| 44587.729166666664 | 30.5 |
| 44587.739583333336 | 30.55 |
| 44587.75 | 30.59 |
| 44587.760416666664 | 30.65 |
| 44587.770833333336 | 30.7 |
| 44587.78125 | 30.77 |
| 44587.791666666664 | 30.82 |
| 44587.802083333336 | 30.85 |
| 44587.8125 | 30.87 |
| 44587.822916666664 | 30.9 |
| 44587.833333333336 | 30.87 |
| 44587.84375 | 30.94 |
| 44587.854166666664 | 30.9 |
| 44587.864583333336 | 30.9 |
| 44587.875 | 30.88 |
| 44587.885416666664 | 30.83 |
| 44587.895833333336 | 30.8 |
| 44587.90625 | 30.74 |
| 44587.916666666664 | 30.69 |
| 44587.927083333336 | 30.62 |
| 44587.9375 | 30.54 |
| 44587.947916666664 | 30.43 |
| 44587.958333333336 | 30.34 |
| 44587.96875 | 30.21 |
| 44587.979166666664 | 30.22 |
| 44587.989583333336 | 30.13 |
| 44588.0 | 29.93 |
| 44588.010416666664 | 29.75 |
| 44588.020833333336 | 29.54 |
| 44588.03125 | 29.35 |
| 44588.041666666664 | 29.15 |
| 44588.052083333336 | 29.09 |
| 44588.0625 | 28.92 |
| 44588.072916666664 | 28.8 |
| 44588.083333333336 | 28.65 |
| 44588.09375 | 28.62 |
| 44588.104166666664 | 28.63 |
| 44588.114583333336 | 28.82 |
| 44588.125 | 28.87 |
| 44588.135416666664 | 28.96 |
| 44588.145833333336 | 29.15 |
| 44588.15625 | 29.35 |
| 44588.166666666664 | 29.74 |
| 44588.177083333336 | 30.02 |
| 44588.1875 | 30.19 |
| 44588.197916666664 | 30.32 |
| 44588.208333333336 | 30.45 |
| 44588.21875 | 30.55 |
| 44588.229166666664 | 30.61 |
| 44588.239583333336 | 30.65 |
| 44588.25 | 30.7 |
| 44588.260416666664 | 30.76 |
| 44588.270833333336 | 30.82 |
| 44588.28125 | 30.9 |
| 44588.291666666664 | 30.96 |
| 44588.302083333336 | 31.02 |
| 44588.3125 | 31.05 |
| 44588.322916666664 | 31.1 |
| 44588.333333333336 | 31.13 |
| 44588.34375 | 31.15 |
| 44588.354166666664 | 31.16 |
| 44588.364583333336 | 31.16 |
| 44588.375 | 31.18 |
| 44588.385416666664 | 31.05 |
| 44588.395833333336 | 31.12 |
| 44588.40625 | 31.1 |
| 44588.416666666664 | 31.07 |
| 44588.427083333336 | 31.05 |
| 44588.4375 | 31.06 |
| 44588.447916666664 | 31 |
| 44588.458333333336 | 30.96 |
| 44588.46875 | 30.9 |
| 44588.479166666664 | 30.87 |
| 44588.489583333336 | 30.8 |
| 44588.5 | 30.58 |
| 44588.510416666664 | 30.49 |
| 44588.520833333336 | 30.44 |
| 44588.53125 | 30.14 |
| 44588.541666666664 | 29.95 |
| 44588.552083333336 | 29.82 |
| 44588.5625 | 29.66 |
| 44588.572916666664 | 29.5 |
| 44588.583333333336 | 29.46 |
| 44588.59375 | 29.38 |
| 44588.604166666664 | 29.35 |
| 44588.614583333336 | 29.32 |
| 44588.625 | 29.29 |
| 44588.635416666664 | 29.31 |
| 44588.645833333336 | 29.37 |
| 44588.65625 | 29.39 |
| 44588.666666666664 | 29.42 |
| 44588.677083333336 | 29.43 |
| 44588.6875 | 29.71 |
| 44588.697916666664 | 29.78 |
| 44588.708333333336 | 29.92 |
| 44588.71875 | 30.12 |
| 44588.729166666664 | 30.35 |
| 44588.739583333336 | 30.49 |
| 44588.75 | 30.53 |
| 44588.760416666664 | 30.6 |
| 44588.770833333336 | 30.8 |
| 44588.78125 | 30.81 |
| 44588.791666666664 | 30.8 |
| 44588.802083333336 | 30.76 |
| 44588.8125 | 30.78 |
| 44588.822916666664 | 30.85 |
| 44588.833333333336 | 30.86 |
| 44588.84375 | 30.9 |
| 44588.854166666664 | 30.92 |
| 44588.864583333336 | 30.95 |
| 44588.875 | 30.93 |
| 44588.885416666664 | 30.93 |
| 44588.895833333336 | 30.94 |
| 44588.90625 | 30.85 |
| 44588.916666666664 | 30.91 |
| 44588.927083333336 | 30.86 |
| 44588.9375 | 30.9 |
| 44588.947916666664 | 30.87 |
| 44588.958333333336 | 30.86 |
| 44588.96875 | 30.76 |
| 44588.979166666664 | 30.75 |
| 44588.989583333336 | 30.62 |
| 44589.0 | 30.55 |
| 44589.010416666664 | 30.43 |
| 44589.020833333336 | 30.16 |
| 44589.03125 | 30.03 |
| 44589.041666666664 | 29.85 |
| 44589.052083333336 | 29.73 |
| 44589.0625 | 29.65 |
| 44589.072916666664 | 29.55 |
| 44589.083333333336 | 29.52 |
| 44589.09375 | 29.36 |
| 44589.104166666664 | 29.29 |
| 44589.114583333336 | 29.17 |
| 44589.125 | 29.13 |
| 44589.135416666664 | 29.25 |
| 44589.145833333336 | 29.31 |
| 44589.15625 | 29.29 |
| 44589.166666666664 | 29.37 |
| 44589.177083333336 | 29.48 |
| 44589.1875 | 29.61 |
| 44589.197916666664 | 29.91 |
| 44589.208333333336 | 30.17 |
| 44589.21875 | 30.39 |
| 44589.229166666664 | 30.57 |
| 44589.239583333336 | 30.69 |
| 44589.25 | 30.76 |
| 44589.260416666664 | 30.85 |
| 44589.270833333336 | 30.89 |
| 44589.28125 | 30.94 |
| 44589.291666666664 | 31 |
| 44589.302083333336 | 31.1 |
| 44589.3125 | 31.2 |
| 44589.322916666664 | 31.26 |
| 44589.333333333336 | 31.3 |
| 44589.34375 | 31.32 |
| 44589.354166666664 | 31.34 |
| 44589.364583333336 | 31.35 |
| 44589.375 | 31.35 |
| 44589.385416666664 | 31.35 |
| 44589.395833333336 | 31.36 |
| 44589.40625 | 31.36 |
| 44589.416666666664 | 31.36 |
| 44589.427083333336 | 31.29 |
| 44589.4375 | 31.31 |
| 44589.447916666664 | 31.3 |
| 44589.458333333336 | 31.25 |
| 44589.46875 | 31.23 |
| 44589.479166666664 | 31.23 |
| 44589.489583333336 | 31.18 |
| 44589.5 | 31.18 |
| 44589.510416666664 | 31.17 |
| 44589.520833333336 | 31.1 |
| 44589.53125 | 31.01 |
| 44589.541666666664 | 30.87 |
| 44589.552083333336 | 30.77 |
| 44589.5625 | 30.72 |
| 44589.572916666664 | 30.58 |
| 44589.583333333336 | 30.37 |
| 44589.59375 | 30.29 |
| 44589.604166666664 | 30.14 |
| 44589.614583333336 | 29.97 |
| 44589.625 | 29.75 |
| 44589.635416666664 | 29.65 |
| 44589.645833333336 | 29.53 |
| 44589.65625 | 29.46 |
| 44589.666666666664 | 29.38 |
| 44589.677083333336 | 29.41 |
| 44589.6875 | 29.37 |
| 44589.697916666664 | 29.49 |
| 44589.708333333336 | 29.49 |
| 44589.71875 | 29.54 |
| 44589.729166666664 | 29.59 |
| 44589.739583333336 | 29.75 |
| 44589.75 | 29.9 |
| 44589.760416666664 | 30.18 |
| 44589.770833333336 | 30.52 |
| 44589.78125 | 30.72 |
| 44589.791666666664 | 30.76 |
| 44589.802083333336 | 30.75 |
| 44589.8125 | 30.77 |
| 44589.822916666664 | 30.82 |
| 44589.833333333336 | 30.88 |
| 44589.84375 | 30.95 |
| 44589.854166666664 | 31 |
| 44589.864583333336 | 31.05 |
| 44589.875 | 31.09 |
| 44589.885416666664 | 31.14 |
| 44589.895833333336 | 31.2 |
| 44589.90625 | 31.24 |
| 44589.916666666664 | 31.09 |
| 44589.927083333336 | 31.29 |
| 44589.9375 | 31.31 |
| 44589.947916666664 | 31.14 |
| 44589.958333333336 | 31.27 |
| 44589.96875 | 31.24 |
| 44589.979166666664 | 31.21 |
| 44589.989583333336 | 31.15 |
| 44590.0 | 31.14 |
| 44590.010416666664 | 31.07 |
| 44590.020833333336 | 31.04 |
| 44590.03125 | 30.95 |
| 44590.041666666664 | 30.87 |
| 44590.052083333336 | 30.76 |
| 44590.0625 | 30.6 |
| 44590.072916666664 | 30.5 |
| 44590.083333333336 | 30.38 |
| 44590.09375 | 30.13 |
| 44590.104166666664 | 29.95 |
| 44590.114583333336 | 29.87 |
| 44590.125 | 29.89 |
| 44590.135416666664 | 29.82 |
| 44590.145833333336 | 29.8 |
| 44590.15625 | 29.79 |
| 44590.166666666664 | 29.73 |
| 44590.177083333336 | 29.65 |
| 44590.1875 | 29.74 |
| 44590.197916666664 | 29.77 |
| 44590.208333333336 | 29.78 |
| 44590.21875 | 29.82 |
| 44590.229166666664 | 30.01 |
| 44590.239583333336 | 30.29 |
| 44590.25 | 30.37 |
| 44590.260416666664 | 30.4 |
| 44590.270833333336 | 30.43 |
| 44590.28125 | 30.47 |
| 44590.291666666664 | 30.55 |
| 44590.302083333336 | 30.62 |
| 44590.3125 | 30.71 |
| 44590.322916666664 | 30.8 |
| 44590.333333333336 | 30.86 |
| 44590.34375 | 30.93 |
| 44590.354166666664 | 30.99 |
| 44590.364583333336 | 31.06 |
| 44590.375 | 31.14 |
| 44590.385416666664 | 31.17 |
| 44590.395833333336 | 31.19 |
| 44590.40625 | 31.2 |
| 44590.416666666664 | 31.22 |
| 44590.427083333336 | 31.23 |
| 44590.4375 | 31.23 |
| 44590.447916666664 | 31.23 |
| 44590.458333333336 | 31.23 |
| 44590.46875 | 31.19 |
| 44590.479166666664 | 31.18 |
| 44590.489583333336 | 31.19 |
| 44590.5 | 31.19 |
| 44590.510416666664 | 31.16 |
| 44590.520833333336 | 31.08 |
| 44590.53125 | 30.98 |
| 44590.541666666664 | 30.94 |
| 44590.552083333336 | 30.93 |
| 44590.5625 | 30.9 |
| 44590.572916666664 | 30.86 |
| 44590.583333333336 | 30.79 |
| 44590.59375 | 30.7 |
| 44590.604166666664 | 30.66 |
| 44590.614583333336 | 30.53 |
| 44590.625 | 30.52 |
| 44590.635416666664 | 30.43 |
| 44590.645833333336 | 30.46 |
| 44590.65625 | 30.42 |
| 44590.666666666664 | 30.4 |
| 44590.677083333336 | 30.3 |
| 44590.6875 | 30.26 |
| 44590.697916666664 | 30.12 |
| 44590.708333333336 | 29.89 |
| 44590.71875 | 29.75 |
| 44590.729166666664 | 29.49 |
| 44590.739583333336 | 29.37 |
| 44590.75 | 29.34 |
| 44590.760416666664 | 29.49 |
| 44590.770833333336 | 29.54 |
| 44590.78125 | 29.6 |
| 44590.791666666664 | 29.72 |
| 44590.802083333336 | 29.98 |
| 44590.8125 | 30.32 |
| 44590.822916666664 | 30.47 |
| 44590.833333333336 | 30.5 |
| 44590.84375 | 30.56 |
| 44590.854166666664 | 30.62 |
| 44590.864583333336 | 30.65 |
| 44590.875 | 30.7 |
| 44590.885416666664 | 30.77 |
| 44590.895833333336 | 30.81 |
| 44590.90625 | 30.91 |
| 44590.916666666664 | 31.01 |
| 44590.927083333336 | 31.06 |
| 44590.9375 | 31.12 |
| 44590.947916666664 | 31.16 |
| 44590.958333333336 | 31.19 |
| 44590.96875 | 31.21 |
| 44590.979166666664 | 31.23 |
| 44590.989583333336 | 31.2 |
| 44591.0 | 31.1 |
| 44591.010416666664 | 31.17 |
| 44591.020833333336 | 31.17 |
| 44591.03125 | 31.15 |
| 44591.041666666664 | 31.09 |
| 44591.052083333336 | 31.04 |
| 44591.0625 | 30.99 |
| 44591.072916666664 | 30.97 |
| 44591.083333333336 | 30.9 |
| 44591.09375 | 30.78 |
| 44591.104166666664 | 30.67 |
| 44591.114583333336 | 30.6 |
| 44591.125 | 30.62 |
| 44591.135416666664 | 30.59 |
| 44591.145833333336 | 30.54 |
| 44591.15625 | 30.31 |
| 44591.166666666664 | 29.97 |
| 44591.177083333336 | 29.85 |
| 44591.1875 | 29.58 |
| 44591.197916666664 | 29.28 |
| 44591.208333333336 | 29.13 |
| 44591.21875 | 29.01 |
| 44591.229166666664 | 28.94 |
| 44591.239583333336 | 29 |
| 44591.25 | 29.12 |
| 44591.260416666664 | 29.22 |
| 44591.270833333336 | 29.33 |
| 44591.28125 | 29.48 |
| 44591.291666666664 | 30.02 |
| 44591.302083333336 | 30.33 |
| 44591.3125 | 30.42 |
| 44591.322916666664 | 30.49 |
| 44591.333333333336 | 30.56 |
| 44591.34375 | 30.62 |
| 44591.354166666664 | 30.69 |
| 44591.364583333336 | 30.82 |
| 44591.375 | 30.96 |
| 44591.385416666664 | 31.09 |
| 44591.395833333336 | 31.19 |
| 44591.40625 | 31.24 |
| 44591.416666666664 | 31.26 |
| 44591.427083333336 | 31.28 |
| 44591.4375 | 31.29 |
| 44591.447916666664 | 31.3 |
| 44591.458333333336 | 31.29 |
| 44591.46875 | 31.31 |
| 44591.479166666664 | 31.32 |
| 44591.489583333336 | 31.33 |
| 44591.5 | 31.36 |
| 44591.510416666664 | 31.37 |
| 44591.520833333336 | 31.25 |
| 44591.53125 | 31.28 |
| 44591.541666666664 | 31.34 |
| 44591.552083333336 | 31.31 |
| 44591.5625 | 31.26 |
| 44591.572916666664 | 31.26 |
| 44591.583333333336 | 31.25 |
| 44591.59375 | 31.22 |
| 44591.604166666664 | 31.17 |
| 44591.614583333336 | 31.2 |
| 44591.625 | 31.08 |
| 44591.635416666664 | 31.01 |
| 44591.645833333336 | 30.98 |
| 44591.65625 | 30.95 |
| 44591.666666666664 | 30.94 |
| 44591.677083333336 | 30.84 |
| 44591.6875 | 30.78 |
| 44591.697916666664 | 30.75 |
| 44591.708333333336 | 30.62 |
| 44591.71875 | 30.37 |
| 44591.729166666664 | 30.19 |
| 44591.739583333336 | 30 |
| 44591.75 | 29.88 |
| 44591.760416666664 | 29.79 |
| 44591.770833333336 | 29.75 |
| 44591.78125 | 29.76 |
| 44591.791666666664 | 29.86 |
| 44591.802083333336 | 29.9 |
| 44591.8125 | 29.94 |
| 44591.822916666664 | 30.01 |
| 44591.833333333336 | 30.14 |
| 44591.84375 | 30.31 |
| 44591.854166666664 | 30.53 |
| 44591.864583333336 | 30.71 |
| 44591.875 | 30.75 |
| 44591.885416666664 | 30.81 |
| 44591.895833333336 | 30.84 |
| 44591.90625 | 30.86 |
| 44591.916666666664 | 30.89 |
| 44591.927083333336 | 30.92 |
| 44591.9375 | 30.98 |
| 44591.947916666664 | 31.03 |
| 44591.958333333336 | 31.09 |
| 44591.96875 | 31.16 |
| 44591.979166666664 | 31.2 |
| 44591.989583333336 | 31.23 |
| 44592.0 | 31.24 |
| 44592.010416666664 | 30.99 |
| 44592.020833333336 | 31.1 |
| 44592.03125 | 31.13 |
| 44592.041666666664 | 31.03 |
| 44592.052083333336 | 31.13 |
| 44592.0625 | 31.08 |
| 44592.072916666664 | 31.14 |
| 44592.083333333336 | 31.1 |
| 44592.09375 | 30.99 |
| 44592.104166666664 | 30.94 |
| 44592.114583333336 | 30.85 |
| 44592.125 | 30.7 |
| 44592.135416666664 | 30.57 |
| 44592.145833333336 | 30.42 |
| 44592.15625 | 30.25 |
| 44592.166666666664 | 30 |
| 44592.177083333336 | 29.78 |
| 44592.1875 | 29.66 |
| 44592.197916666664 | 29.35 |
| 44592.208333333336 | 29.2 |
| 44592.21875 | 29.06 |
| 44592.229166666664 | 29.07 |
| 44592.239583333336 | 29.08 |
| 44592.25 | 29.09 |
| 44592.260416666664 | 29.13 |
| 44592.270833333336 | 29.1 |
| 44592.28125 | 29.15 |
| 44592.291666666664 | 29.09 |
| 44592.302083333336 | 29.08 |
| 44592.3125 | 29.08 |
| 44592.322916666664 | 29.23 |
| 44592.333333333336 | 29.52 |
| 44592.34375 | 29.69 |
| 44592.354166666664 | 30.03 |
| 44592.364583333336 | 30.22 |
| 44592.375 | 30.36 |
| 44592.385416666664 | 30.49 |
| 44592.395833333336 | 30.62 |
| 44592.40625 | 30.76 |
| 44592.416666666664 | 30.92 |
| 44592.427083333336 | 31.03 |
| 44592.4375 | 31.11 |
| 44592.447916666664 | 31.17 |
| 44592.458333333336 | 31.22 |
| 44592.46875 | 31.25 |
| 44592.479166666664 | 31.25 |
| 44592.489583333336 | 31.24 |
| 44592.5 | 31.23 |
| 44592.510416666664 | 31.23 |
| 44592.520833333336 | 31.24 |
| 44592.53125 | 31.24 |
| 44592.541666666664 | 31.23 |
| 44592.552083333336 | 31.17 |
| 44592.5625 | 31.16 |
| 44592.572916666664 | 31.19 |
| 44592.583333333336 | 31.16 |
| 44592.59375 | 31.16 |
| 44592.604166666664 | 31.15 |
| 44592.614583333336 | 31.12 |
| 44592.625 | 31.12 |
| 44592.635416666664 | 31.04 |
| 44592.645833333336 | 30.93 |
| 44592.65625 | 30.9 |
| 44592.666666666664 | 30.8 |
| 44592.677083333336 | 30.74 |
| 44592.6875 | 30.7 |
| 44592.697916666664 | 30.45 |
| 44592.708333333336 | 30.36 |
| 44592.71875 | 30.29 |
| 44592.729166666664 | 30.01 |
| 44592.739583333336 | 29.86 |
| 44592.75 | 29.71 |
| 44592.760416666664 | 29.61 |
| 44592.770833333336 | 29.52 |
| 44592.78125 | 29.61 |
| 44592.791666666664 | 29.63 |
| 44592.802083333336 | 29.65 |
| 44592.8125 | 29.62 |
| 44592.822916666664 | 29.66 |
| 44592.833333333336 | 29.57 |
| 44592.84375 | 29.54 |
| 44592.854166666664 | 29.55 |
| 44592.864583333336 | 29.53 |
| 44592.875 | 29.57 |
| 44592.885416666664 | 29.92 |
| 44592.895833333336 | 30.2 |
| 44592.90625 | 30.2 |
| 44592.916666666664 | 30.2 |
| 44592.927083333336 | 30.35 |
| 44592.9375 | 30.45 |
| 44592.947916666664 | 30.53 |
| 44592.958333333336 | 30.79 |
| 44592.96875 | 30.95 |
| 44592.979166666664 | 31.03 |
| 44592.989583333336 | 31.09 |
| 44593.0 | 31.13 |
| 44593.010416666664 | 31.17 |
| 44593.020833333336 | 31.18 |
| 44593.03125 | 31.15 |
| 44593.041666666664 | 31.21 |
| 44593.052083333336 | 31.11 |
| 44593.0625 | 31.14 |
| 44593.072916666664 | 31.18 |
| 44593.083333333336 | 31.17 |
| 44593.09375 | 31.13 |
| 44593.104166666664 | 31.14 |
| 44593.114583333336 | 31.07 |
| 44593.125 | 30.91 |
| 44593.135416666664 | 30.95 |
| 44593.145833333336 | 30.85 |
| 44593.15625 | 30.72 |